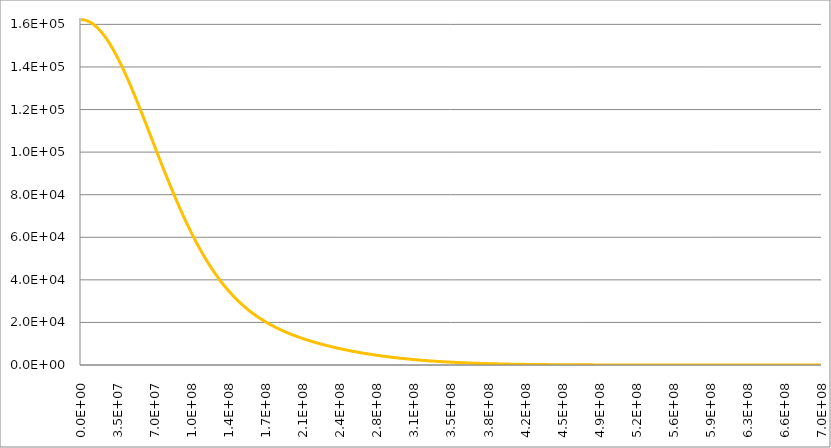
| Category | Series 1 | Series 0 | Series 2 | Series 3 |
|---|---|---|---|---|
| 0.0 |  |  |  | 1622 |
| 347850.0 |  |  |  | 162198.039 |
| 695700.0 |  |  |  | 162192.158 |
| 1043550.0 |  |  |  | 162182.356 |
| 1391400.0 |  |  |  | 162168.634 |
| 1739250.0 |  |  |  | 162150.993 |
| 2087100.0 |  |  |  | 162129.436 |
| 2434950.0 |  |  |  | 162103.963 |
| 2782800.0 |  |  |  | 162074.578 |
| 3130650.0 |  |  |  | 162041.281 |
| 3478500.0 |  |  |  | 162004.077 |
| 3826350.0 |  |  |  | 161962.969 |
| 4174200.0 |  |  |  | 161917.959 |
| 4522050.0 |  |  |  | 161869.052 |
| 4869900.0 |  |  |  | 161816.252 |
| 5217750.0 |  |  |  | 161759.564 |
| 5565600.0 |  |  |  | 161698.991 |
| 5913450.0 |  |  |  | 161634.54 |
| 6261300.0 |  |  |  | 161566.216 |
| 6609150.0 |  |  |  | 161494.024 |
| 6957000.0 |  |  |  | 161417.971 |
| 7304850.0 |  |  |  | 161338.063 |
| 7652700.0 |  |  |  | 161254.306 |
| 8000550.0 |  |  |  | 161166.709 |
| 8348400.0 |  |  |  | 161075.278 |
| 8696250.0 |  |  |  | 160980.021 |
| 9044100.0 |  |  |  | 160880.946 |
| 9391950.0 |  |  |  | 160778.061 |
| 9739800.0 |  |  |  | 160671.376 |
| 10087650.0 |  |  |  | 160560.899 |
| 10435500.0 |  |  |  | 160446.639 |
| 10783350.0 |  |  |  | 160328.606 |
| 11131200.0 |  |  |  | 160206.81 |
| 11479050.0 |  |  |  | 160081.261 |
| 11826900.0 |  |  |  | 159951.97 |
| 12174750.0 |  |  |  | 159818.948 |
| 12522600.0 |  |  |  | 159682.205 |
| 12870450.0 |  |  |  | 159541.753 |
| 13218300.0 |  |  |  | 159397.605 |
| 13566150.0 |  |  |  | 159249.771 |
| 13914000.0 |  |  |  | 159098.265 |
| 14261850.0 |  |  |  | 158943.099 |
| 14609700.0 |  |  |  | 158784.286 |
| 14957550.0 |  |  |  | 158621.839 |
| 15305400.0 |  |  |  | 158455.772 |
| 15653250.0 |  |  |  | 158286.098 |
| 16001100.0 |  |  |  | 158112.832 |
| 16348950.0 |  |  |  | 157935.989 |
| 16696800.0 |  |  |  | 157755.582 |
| 17044650.0 |  |  |  | 157571.626 |
| 17392500.0 |  |  |  | 157384.138 |
| 17740350.0 |  |  |  | 157193.133 |
| 18088200.0 |  |  |  | 156998.625 |
| 18436050.0 |  |  |  | 156800.632 |
| 18783900.0 |  |  |  | 156599.17 |
| 19131750.0 |  |  |  | 156394.255 |
| 19479600.0 |  |  |  | 156185.904 |
| 19827450.0 |  |  |  | 155974.134 |
| 20175300.0 |  |  |  | 155758.963 |
| 20523150.0 |  |  |  | 155540.408 |
| 20871000.0 |  |  |  | 155318.488 |
| 21218850.0 |  |  |  | 155093.219 |
| 21566700.0 |  |  |  | 154864.622 |
| 21914550.0 |  |  |  | 154632.714 |
| 22262400.0 |  |  |  | 154397.514 |
| 22610250.0 |  |  |  | 154159.042 |
| 22958100.0 |  |  |  | 153917.316 |
| 23305950.0 |  |  |  | 153672.357 |
| 23653800.0 |  |  |  | 153424.184 |
| 24001650.0 |  |  |  | 153172.818 |
| 24349500.0 |  |  |  | 152918.278 |
| 24697350.0 |  |  |  | 152660.585 |
| 25045200.0 |  |  |  | 152399.76 |
| 25393050.0 |  |  |  | 152135.824 |
| 25740900.0 |  |  |  | 151868.798 |
| 26088750.0 |  |  |  | 151598.703 |
| 26436600.0 |  |  |  | 151325.562 |
| 26784450.0 |  |  |  | 151049.395 |
| 27132300.0 |  |  |  | 150770.225 |
| 27480150.0 |  |  |  | 150488.075 |
| 27828000.0 |  |  |  | 150202.966 |
| 28175850.0 |  |  |  | 149914.921 |
| 28523700.0 |  |  |  | 149623.963 |
| 28871550.0 |  |  |  | 149330.115 |
| 29219400.0 |  |  |  | 149033.4 |
| 29567250.0 |  |  |  | 148733.842 |
| 29915100.0 |  |  |  | 148431.464 |
| 30262950.0 |  |  |  | 148126.289 |
| 30610800.0 |  |  |  | 147818.343 |
| 30958650.0 |  |  |  | 147507.648 |
| 31306500.0 |  |  |  | 147194.229 |
| 31654350.0 |  |  |  | 146878.11 |
| 32002200.0 |  |  |  | 146559.316 |
| 32350050.0 |  |  |  | 146237.872 |
| 32697900.0 |  |  |  | 145913.803 |
| 33045750.0 |  |  |  | 145587.133 |
| 33393600.0 |  |  |  | 145257.887 |
| 33741450.0 |  |  |  | 144926.092 |
| 34089300.0 |  |  |  | 144591.772 |
| 34437150.0 |  |  |  | 144254.953 |
| 34785000.0 |  |  |  | 143915.661 |
| 35132850.0 |  |  |  | 143573.921 |
| 35480700.0 |  |  |  | 143229.76 |
| 35828550.0 |  |  |  | 142883.203 |
| 36176400.0 |  |  |  | 142534.277 |
| 36524250.0 |  |  |  | 142183.009 |
| 36872100.0 |  |  |  | 141829.424 |
| 37219950.0 |  |  |  | 141473.549 |
| 37567800.0 |  |  |  | 141115.411 |
| 37915650.0 |  |  |  | 140755.037 |
| 38263500.0 |  |  |  | 140392.453 |
| 38611350.0 |  |  |  | 140027.686 |
| 38959200.0 |  |  |  | 139660.764 |
| 39307050.0 |  |  |  | 139291.713 |
| 39654900.0 |  |  |  | 138920.561 |
| 40002750.0 |  |  |  | 138547.335 |
| 40350600.0 |  |  |  | 138172.063 |
| 40698450.0 |  |  |  | 137794.771 |
| 41046300.0 |  |  |  | 137415.488 |
| 41394150.0 |  |  |  | 137034.24 |
| 41742000.0 |  |  |  | 136651.057 |
| 42089850.0 |  |  |  | 136265.964 |
| 42437700.0 |  |  |  | 135878.991 |
| 42785550.0 |  |  |  | 135490.165 |
| 43133400.0 |  |  |  | 135099.513 |
| 43481250.0 |  |  |  | 134707.065 |
| 43829100.0 |  |  |  | 134312.847 |
| 44176950.0 |  |  |  | 133916.887 |
| 44524800.0 |  |  |  | 133519.215 |
| 44872650.0 |  |  |  | 133119.857 |
| 45220500.0 |  |  |  | 132718.842 |
| 45568350.0 |  |  |  | 132316.198 |
| 45916200.0 |  |  |  | 131911.953 |
| 46264050.0 |  |  |  | 131506.135 |
| 46611900.0 |  |  |  | 131098.773 |
| 46959750.0 |  |  |  | 130689.895 |
| 47307600.0 |  |  |  | 130279.529 |
| 47655450.0 |  |  |  | 129867.702 |
| 48003300.0 |  |  |  | 129454.445 |
| 48351150.0 |  |  |  | 129039.783 |
| 48699000.0 |  |  |  | 128623.747 |
| 49046850.0 |  |  |  | 128206.363 |
| 49394700.0 |  |  |  | 127787.661 |
| 49742550.0 |  |  |  | 127367.668 |
| 50090400.0 |  |  |  | 126946.412 |
| 50438250.0 |  |  |  | 126523.922 |
| 50786100.0 |  |  |  | 126100.226 |
| 51133950.0 |  |  |  | 125675.352 |
| 51481800.0 |  |  |  | 125249.328 |
| 51829650.0 |  |  |  | 124822.181 |
| 52177500.0 |  |  |  | 124393.941 |
| 52525350.0 |  |  |  | 123964.634 |
| 52873200.0 |  |  |  | 123534.29 |
| 53221050.0 |  |  |  | 123102.935 |
| 53568900.0 |  |  |  | 122670.597 |
| 53916750.0 |  |  |  | 122237.305 |
| 54264600.0 |  |  |  | 121803.086 |
| 54612450.0 |  |  |  | 121367.967 |
| 54960300.0 |  |  |  | 120931.977 |
| 55308150.0 |  |  |  | 120495.142 |
| 55656000.0 |  |  |  | 120057.491 |
| 56003850.0 |  |  |  | 119619.05 |
| 56351700.0 |  |  |  | 119179.847 |
| 56699550.0 |  |  |  | 118739.91 |
| 57047400.0 |  |  |  | 118299.264 |
| 57395250.0 |  |  |  | 117857.939 |
| 57743100.0 |  |  |  | 117415.96 |
| 58090950.0 |  |  |  | 116973.354 |
| 58438800.0 |  |  |  | 116530.148 |
| 58786650.0 |  |  |  | 116086.37 |
| 59134500.0 |  |  |  | 115642.045 |
| 59482350.0 |  |  |  | 115197.2 |
| 59830200.0 |  |  |  | 114751.862 |
| 60178050.0 |  |  |  | 114306.057 |
| 60525900.0 |  |  |  | 113859.811 |
| 60873750.0 |  |  |  | 113413.15 |
| 61221600.0 |  |  |  | 112966.101 |
| 61569450.0 |  |  |  | 112518.69 |
| 61917300.0 |  |  |  | 112070.941 |
| 62265150.0 |  |  |  | 111622.882 |
| 62613000.0 |  |  |  | 111174.536 |
| 62960850.0 |  |  |  | 110725.931 |
| 63308700.0 |  |  |  | 110277.091 |
| 63656550.0 |  |  |  | 109828.041 |
| 64004400.0 |  |  |  | 109378.807 |
| 64352250.0 |  |  |  | 108929.413 |
| 64700100.0 |  |  |  | 108479.885 |
| 65047950.0 |  |  |  | 108030.246 |
| 65395800.0 |  |  |  | 107580.522 |
| 65743650.0 |  |  |  | 107130.737 |
| 66091500.0 |  |  |  | 106680.915 |
| 66439350.0 |  |  |  | 106231.08 |
| 66787200.0 |  |  |  | 105781.257 |
| 67135050.0 |  |  |  | 105331.468 |
| 67482900.0 |  |  |  | 104881.738 |
| 67830750.0 |  |  |  | 104432.091 |
| 68178600.0 |  |  |  | 103982.549 |
| 68526450.0 |  |  |  | 103533.136 |
| 68874300.0 |  |  |  | 103083.875 |
| 69222150.0 |  |  |  | 102634.789 |
| 69570000.0 |  |  |  | 102185.9 |
| 69917850.0 |  |  |  | 101737.232 |
| 70265700.0 |  |  |  | 101288.807 |
| 70613550.0 |  |  |  | 100840.646 |
| 70961400.0 |  |  |  | 100392.772 |
| 71309250.0 |  |  |  | 99945.207 |
| 71657100.0 |  |  |  | 99497.973 |
| 72004950.0 |  |  |  | 99051.091 |
| 72352800.0 |  |  |  | 98604.583 |
| 72700650.0 |  |  |  | 98158.47 |
| 73048500.0 |  |  |  | 97712.772 |
| 73396350.0 |  |  |  | 97267.512 |
| 73744200.0 |  |  |  | 96822.709 |
| 74092050.0 |  |  |  | 96378.385 |
| 74439900.0 |  |  |  | 95934.559 |
| 74787750.0 |  |  |  | 95491.252 |
| 75135600.0 |  |  |  | 95048.483 |
| 75483450.0 |  |  |  | 94606.273 |
| 75831300.0 |  |  |  | 94164.641 |
| 76179150.0 |  |  |  | 93723.607 |
| 76527000.0 |  |  |  | 93283.19 |
| 76874850.0 |  |  |  | 92843.408 |
| 77222700.0 |  |  |  | 92404.281 |
| 77570550.0 |  |  |  | 91965.828 |
| 77918400.0 |  |  |  | 91528.067 |
| 78266250.0 |  |  |  | 91091.016 |
| 78614100.0 |  |  |  | 90654.694 |
| 78961950.0 |  |  |  | 90219.118 |
| 79309800.0 |  |  |  | 89784.306 |
| 79657650.0 |  |  |  | 89350.276 |
| 80005500.0 |  |  |  | 88917.045 |
| 80353350.0 |  |  |  | 88484.63 |
| 80701200.0 |  |  |  | 88053.048 |
| 81049050.0 |  |  |  | 87622.316 |
| 81396900.0 |  |  |  | 87192.451 |
| 81744750.0 |  |  |  | 86763.468 |
| 82092600.0 |  |  |  | 86335.384 |
| 82440450.0 |  |  |  | 85908.215 |
| 82788300.0 |  |  |  | 85481.977 |
| 83136150.0 |  |  |  | 85056.685 |
| 83484000.0 |  |  |  | 84632.355 |
| 83831850.0 |  |  |  | 84209.001 |
| 84179700.0 |  |  |  | 83786.64 |
| 84527550.0 |  |  |  | 83365.285 |
| 84875400.0 |  |  |  | 82944.951 |
| 85223250.0 |  |  |  | 82525.652 |
| 85571100.0 |  |  |  | 82107.404 |
| 85918950.0 |  |  |  | 81690.219 |
| 86266800.0 |  |  |  | 81274.111 |
| 86614650.0 |  |  |  | 80859.094 |
| 86962500.0 |  |  |  | 80445.182 |
| 87310350.0 |  |  |  | 80032.387 |
| 87658200.0 |  |  |  | 79620.722 |
| 88006050.0 |  |  |  | 79210.201 |
| 88353900.0 |  |  |  | 78800.835 |
| 88701750.0 |  |  |  | 78392.638 |
| 89049600.0 |  |  |  | 77985.621 |
| 89397450.0 |  |  |  | 77579.796 |
| 89745300.0 |  |  |  | 77175.175 |
| 90093150.0 |  |  |  | 76771.769 |
| 90441000.0 |  |  |  | 76369.591 |
| 90788850.0 |  |  |  | 75968.65 |
| 91136700.0 |  |  |  | 75568.959 |
| 91484550.0 |  |  |  | 75170.527 |
| 91832400.0 |  |  |  | 74773.366 |
| 92180250.0 |  |  |  | 74377.485 |
| 92528100.0 |  |  |  | 73982.895 |
| 92875950.0 |  |  |  | 73589.606 |
| 93223800.0 |  |  |  | 73197.627 |
| 93571650.0 |  |  |  | 72806.969 |
| 93919500.0 |  |  |  | 72417.64 |
| 94267350.0 |  |  |  | 72029.649 |
| 94615200.0 |  |  |  | 71643.006 |
| 94963050.0 |  |  |  | 71257.72 |
| 95310900.0 |  |  |  | 70873.799 |
| 95658750.0 |  |  |  | 70491.251 |
| 96006600.0 |  |  |  | 70110.085 |
| 96354450.0 |  |  |  | 69730.308 |
| 96702300.0 |  |  |  | 69351.929 |
| 97050150.0 |  |  |  | 68974.955 |
| 97398000.0 |  |  |  | 68599.394 |
| 97745850.0 |  |  |  | 68225.253 |
| 98093700.0 |  |  |  | 67852.538 |
| 98441550.0 |  |  |  | 67481.257 |
| 98789400.0 |  |  |  | 67111.417 |
| 99137250.0 |  |  |  | 66743.023 |
| 99485100.0 |  |  |  | 66376.083 |
| 99832950.0 |  |  |  | 66010.602 |
| 100180800.0 |  |  |  | 65646.587 |
| 100528650.0 |  |  |  | 65284.043 |
| 100876500.0 |  |  |  | 64922.976 |
| 101224350.0 |  |  |  | 64563.39 |
| 101572200.0 |  |  |  | 64205.293 |
| 101920050.0 |  |  |  | 63848.688 |
| 102267900.0 |  |  |  | 63493.58 |
| 102615750.0 |  |  |  | 63139.974 |
| 102963600.0 |  |  |  | 62787.875 |
| 103311450.0 |  |  |  | 62437.287 |
| 103659300.0 |  |  |  | 62088.214 |
| 104007150.0 |  |  |  | 61740.66 |
| 104355000.0 |  |  |  | 61394.629 |
| 104702850.0 |  |  |  | 61050.125 |
| 105050700.0 |  |  |  | 60707.151 |
| 105398550.0 |  |  |  | 60365.711 |
| 105746400.0 |  |  |  | 60025.807 |
| 106094250.0 |  |  |  | 59687.443 |
| 106442100.0 |  |  |  | 59350.622 |
| 106789950.0 |  |  |  | 59015.346 |
| 107137800.0 |  |  |  | 58681.618 |
| 107485650.0 |  |  |  | 58349.44 |
| 107833500.0 |  |  |  | 58018.815 |
| 108181350.0 |  |  |  | 57689.743 |
| 108529200.0 |  |  |  | 57362.229 |
| 108877050.0 |  |  |  | 57036.272 |
| 109224900.0 |  |  |  | 56711.875 |
| 109572750.0 |  |  |  | 56389.039 |
| 109920600.0 |  |  |  | 56067.765 |
| 110268450.0 |  |  |  | 55748.055 |
| 110616300.0 |  |  |  | 55429.909 |
| 110964150.0 |  |  |  | 55113.329 |
| 111312000.0 |  |  |  | 54798.315 |
| 111659850.0 |  |  |  | 54484.867 |
| 112007700.0 |  |  |  | 54172.987 |
| 112355550.0 |  |  |  | 53862.674 |
| 112703400.0 |  |  |  | 53553.928 |
| 113051250.0 |  |  |  | 53246.75 |
| 113399100.0 |  |  |  | 52941.138 |
| 113746950.0 |  |  |  | 52637.094 |
| 114094800.0 |  |  |  | 52334.617 |
| 114442650.0 |  |  |  | 52033.706 |
| 114790500.0 |  |  |  | 51734.36 |
| 115138350.0 |  |  |  | 51436.578 |
| 115486200.0 |  |  |  | 51140.36 |
| 115834050.0 |  |  |  | 50845.705 |
| 116181900.0 |  |  |  | 50552.611 |
| 116529750.0 |  |  |  | 50261.078 |
| 116877600.0 |  |  |  | 49971.103 |
| 117225450.0 |  |  |  | 49682.685 |
| 117573300.0 |  |  |  | 49395.823 |
| 117921150.0 |  |  |  | 49110.514 |
| 118269000.0 |  |  |  | 48826.757 |
| 118616850.0 |  |  |  | 48544.55 |
| 118964700.0 |  |  |  | 48263.89 |
| 119312550.0 |  |  |  | 47984.776 |
| 119660400.0 |  |  |  | 47707.205 |
| 120008250.0 |  |  |  | 47431.175 |
| 120356100.0 |  |  |  | 47156.682 |
| 120703950.0 |  |  |  | 46883.725 |
| 121051800.0 |  |  |  | 46612.301 |
| 121399650.0 |  |  |  | 46342.406 |
| 121747500.0 |  |  |  | 46074.038 |
| 122095350.0 |  |  |  | 45807.193 |
| 122443200.0 |  |  |  | 45541.869 |
| 122791050.0 |  |  |  | 45278.063 |
| 123138900.0 |  |  |  | 45015.769 |
| 123486750.0 |  |  |  | 44754.987 |
| 123834600.0 |  |  |  | 44495.711 |
| 124182450.0 |  |  |  | 44237.938 |
| 124530300.0 |  |  |  | 43981.664 |
| 124878150.0 |  |  |  | 43726.887 |
| 125226000.0 |  |  |  | 43473.6 |
| 125573850.0 |  |  |  | 43221.802 |
| 125921700.0 |  |  |  | 42971.487 |
| 126269550.0 |  |  |  | 42722.651 |
| 126617400.0 |  |  |  | 42475.29 |
| 126965250.0 |  |  |  | 42229.401 |
| 127313100.0 |  |  |  | 41984.977 |
| 127660950.0 |  |  |  | 41742.016 |
| 128008800.0 |  |  |  | 41500.512 |
| 128356650.0 |  |  |  | 41260.461 |
| 128704500.0 |  |  |  | 41021.857 |
| 129052350.0 |  |  |  | 40784.698 |
| 129400200.0 |  |  |  | 40548.976 |
| 129748050.0 |  |  |  | 40314.688 |
| 130095900.0 |  |  |  | 40081.829 |
| 130443750.0 |  |  |  | 39850.393 |
| 130791600.0 |  |  |  | 39620.375 |
| 131139450.0 |  |  |  | 39391.771 |
| 131487300.0 |  |  |  | 39164.575 |
| 131835150.0 |  |  |  | 38938.781 |
| 132183000.0 |  |  |  | 38714.385 |
| 132530850.0 |  |  |  | 38491.381 |
| 132878700.0 |  |  |  | 38269.763 |
| 133226550.0 |  |  |  | 38049.527 |
| 133574400.0 |  |  |  | 37830.665 |
| 133922250.0 |  |  |  | 37613.174 |
| 134270100.0 |  |  |  | 37397.047 |
| 134617950.0 |  |  |  | 37182.278 |
| 134965800.0 |  |  |  | 36968.862 |
| 135313650.0 |  |  |  | 36756.792 |
| 135661500.0 |  |  |  | 36546.064 |
| 136009350.0 |  |  |  | 36336.671 |
| 136357200.0 |  |  |  | 36128.607 |
| 136705050.0 |  |  |  | 35921.866 |
| 137052900.0 |  |  |  | 35716.442 |
| 137400750.0 |  |  |  | 35512.329 |
| 137748600.0 |  |  |  | 35309.522 |
| 138096450.0 |  |  |  | 35108.013 |
| 138444300.0 |  |  |  | 34907.797 |
| 138792150.0 |  |  |  | 34708.867 |
| 139140000.0 |  |  |  | 34511.218 |
| 139487850.0 |  |  |  | 34314.842 |
| 139835700.0 |  |  |  | 34119.735 |
| 140183550.0 |  |  |  | 33925.888 |
| 140531400.0 |  |  |  | 33733.297 |
| 140879250.0 |  |  |  | 33541.954 |
| 141227100.0 |  |  |  | 33351.854 |
| 141574950.0 |  |  |  | 33162.989 |
| 141922800.0 |  |  |  | 32975.353 |
| 142270650.0 |  |  |  | 32788.94 |
| 142618500.0 |  |  |  | 32603.744 |
| 142966350.0 |  |  |  | 32419.757 |
| 143314200.0 |  |  |  | 32236.974 |
| 143662050.0 |  |  |  | 32055.388 |
| 144009900.0 |  |  |  | 31874.991 |
| 144357750.0 |  |  |  | 31695.778 |
| 144705600.0 |  |  |  | 31517.742 |
| 145053450.0 |  |  |  | 31340.876 |
| 145401300.0 |  |  |  | 31165.174 |
| 145749150.0 |  |  |  | 30990.629 |
| 146097000.0 |  |  |  | 30817.234 |
| 146444850.0 |  |  |  | 30644.983 |
| 146792700.0 |  |  |  | 30473.87 |
| 147140550.0 |  |  |  | 30303.886 |
| 147488400.0 |  |  |  | 30135.026 |
| 147836250.0 |  |  |  | 29967.283 |
| 148184100.0 |  |  |  | 29800.65 |
| 148531950.0 |  |  |  | 29635.121 |
| 148879800.0 |  |  |  | 29470.689 |
| 149227650.0 |  |  |  | 29307.346 |
| 149575500.0 |  |  |  | 29145.088 |
| 149923350.0 |  |  |  | 28983.905 |
| 150271200.0 |  |  |  | 28823.793 |
| 150619050.0 |  |  |  | 28664.744 |
| 150966900.0 |  |  |  | 28506.752 |
| 151314750.0 |  |  |  | 28349.81 |
| 151662600.0 |  |  |  | 28193.91 |
| 152010450.0 |  |  |  | 28039.047 |
| 152358300.0 |  |  |  | 27885.214 |
| 152706150.0 |  |  |  | 27732.404 |
| 153054000.0 |  |  |  | 27580.61 |
| 153401850.0 |  |  |  | 27429.826 |
| 153749700.0 |  |  |  | 27280.044 |
| 154097550.0 |  |  |  | 27131.26 |
| 154445400.0 |  |  |  | 26983.464 |
| 154793250.0 |  |  |  | 26836.652 |
| 155141100.0 |  |  |  | 26690.817 |
| 155488950.0 |  |  |  | 26545.951 |
| 155836800.0 |  |  |  | 26402.048 |
| 156184650.0 |  |  |  | 26259.102 |
| 156532500.0 |  |  |  | 26117.105 |
| 156880350.0 |  |  |  | 25976.052 |
| 157228200.0 |  |  |  | 25835.937 |
| 157576050.0 |  |  |  | 25696.751 |
| 157923900.0 |  |  |  | 25558.489 |
| 158271750.0 |  |  |  | 25421.144 |
| 158619600.0 |  |  |  | 25284.711 |
| 158967450.0 |  |  |  | 25149.181 |
| 159315300.0 |  |  |  | 25014.55 |
| 159663150.0 |  |  |  | 24880.81 |
| 160011000.0 |  |  |  | 24747.955 |
| 160358850.0 |  |  |  | 24615.978 |
| 160706700.0 |  |  |  | 24484.874 |
| 161054550.0 |  |  |  | 24354.636 |
| 161402400.0 |  |  |  | 24225.257 |
| 161750250.0 |  |  |  | 24096.731 |
| 162098100.0 |  |  |  | 23969.053 |
| 162445950.0 |  |  |  | 23842.215 |
| 162793800.0 |  |  |  | 23716.211 |
| 163141650.0 |  |  |  | 23591.036 |
| 163489500.0 |  |  |  | 23466.683 |
| 163837350.0 |  |  |  | 23343.145 |
| 164185200.0 |  |  |  | 23220.417 |
| 164533050.0 |  |  |  | 23098.493 |
| 164880900.0 |  |  |  | 22977.366 |
| 165228750.0 |  |  |  | 22857.031 |
| 165576600.0 |  |  |  | 22737.481 |
| 165924450.0 |  |  |  | 22618.71 |
| 166272300.0 |  |  |  | 22500.713 |
| 166620150.0 |  |  |  | 22383.483 |
| 166968000.0 |  |  |  | 22267.015 |
| 167315850.0 |  |  |  | 22151.302 |
| 167663700.0 |  |  |  | 22036.338 |
| 168011550.0 |  |  |  | 21922.119 |
| 168359400.0 |  |  |  | 21808.637 |
| 168707250.0 |  |  |  | 21695.888 |
| 169055100.0 |  |  |  | 21583.865 |
| 169402950.0 |  |  |  | 21472.563 |
| 169750800.0 |  |  |  | 21361.975 |
| 170098650.0 |  |  |  | 21252.098 |
| 170446500.0 |  |  |  | 21142.923 |
| 170794350.0 |  |  |  | 21034.447 |
| 171142200.0 |  |  |  | 20926.663 |
| 171490050.0 |  |  |  | 20819.567 |
| 171837900.0 |  |  |  | 20713.151 |
| 172185750.0 |  |  |  | 20607.412 |
| 172533600.0 |  |  |  | 20502.343 |
| 172881450.0 |  |  |  | 20397.939 |
| 173229300.0 |  |  |  | 20294.195 |
| 173577150.0 |  |  |  | 20191.105 |
| 173925000.0 |  |  |  | 20088.664 |
| 174272850.0 |  |  |  | 19986.866 |
| 174620700.0 |  |  |  | 19885.708 |
| 174968550.0 |  |  |  | 19785.182 |
| 175316400.0 |  |  |  | 19685.285 |
| 175664250.0 |  |  |  | 19586.01 |
| 176012100.0 |  |  |  | 19487.353 |
| 176359950.0 |  |  |  | 19389.309 |
| 176707800.0 |  |  |  | 19291.872 |
| 177055650.0 |  |  |  | 19195.038 |
| 177403500.0 |  |  |  | 19098.801 |
| 177751350.0 |  |  |  | 19003.158 |
| 178099200.0 |  |  |  | 18908.101 |
| 178447050.0 |  |  |  | 18813.628 |
| 178794900.0 |  |  |  | 18719.733 |
| 179142750.0 |  |  |  | 18626.41 |
| 179490600.0 |  |  |  | 18533.657 |
| 179838450.0 |  |  |  | 18441.466 |
| 180186300.0 |  |  |  | 18349.835 |
| 180534150.0 |  |  |  | 18258.758 |
| 180882000.0 |  |  |  | 18168.23 |
| 181229850.0 |  |  |  | 18078.248 |
| 181577700.0 |  |  |  | 17988.805 |
| 181925550.0 |  |  |  | 17899.899 |
| 182273400.0 |  |  |  | 17811.524 |
| 182621250.0 |  |  |  | 17723.676 |
| 182969100.0 |  |  |  | 17636.35 |
| 183316950.0 |  |  |  | 17549.542 |
| 183664800.0 |  |  |  | 17463.248 |
| 184012650.0 |  |  |  | 17377.464 |
| 184360500.0 |  |  |  | 17292.184 |
| 184708350.0 |  |  |  | 17207.405 |
| 185056200.0 |  |  |  | 17123.122 |
| 185404050.0 |  |  |  | 17039.332 |
| 185751900.0 |  |  |  | 16956.03 |
| 186099750.0 |  |  |  | 16873.212 |
| 186447600.0 |  |  |  | 16790.874 |
| 186795450.0 |  |  |  | 16709.011 |
| 187143300.0 |  |  |  | 16627.621 |
| 187491150.0 |  |  |  | 16546.698 |
| 187839000.0 |  |  |  | 16466.24 |
| 188186850.0 |  |  |  | 16386.241 |
| 188534700.0 |  |  |  | 16306.698 |
| 188882550.0 |  |  |  | 16227.608 |
| 189230400.0 |  |  |  | 16148.965 |
| 189578250.0 |  |  |  | 16070.768 |
| 189926100.0 |  |  |  | 15993.011 |
| 190273950.0 |  |  |  | 15915.691 |
| 190621800.0 |  |  |  | 15838.805 |
| 190969650.0 |  |  |  | 15762.349 |
| 191317500.0 |  |  |  | 15686.318 |
| 191665350.0 |  |  |  | 15610.71 |
| 192013200.0 |  |  |  | 15535.521 |
| 192361050.0 |  |  |  | 15460.748 |
| 192708900.0 |  |  |  | 15386.386 |
| 193056750.0 |  |  |  | 15312.433 |
| 193404600.0 |  |  |  | 15238.885 |
| 193752450.0 |  |  |  | 15165.739 |
| 194100300.0 |  |  |  | 15092.991 |
| 194448150.0 |  |  |  | 15020.638 |
| 194796000.0 |  |  |  | 14948.676 |
| 195143850.0 |  |  |  | 14877.103 |
| 195491700.0 |  |  |  | 14805.915 |
| 195839550.0 |  |  |  | 14735.109 |
| 196187400.0 |  |  |  | 14664.681 |
| 196535250.0 |  |  |  | 14594.629 |
| 196883100.0 |  |  |  | 14524.95 |
| 197230950.0 |  |  |  | 14455.64 |
| 197578800.0 |  |  |  | 14386.696 |
| 197926650.0 |  |  |  | 14318.116 |
| 198274500.0 |  |  |  | 14249.896 |
| 198622350.0 |  |  |  | 14182.033 |
| 198970200.0 |  |  |  | 14114.525 |
| 199318050.0 |  |  |  | 14047.368 |
| 199665900.0 |  |  |  | 13980.56 |
| 200013750.0 |  |  |  | 13914.097 |
| 200361600.0 |  |  |  | 13847.978 |
| 200709450.0 |  |  |  | 13782.198 |
| 201057300.0 |  |  |  | 13716.756 |
| 201405150.0 |  |  |  | 13651.649 |
| 201753000.0 |  |  |  | 13586.873 |
| 202100850.0 |  |  |  | 13522.427 |
| 202448700.0 |  |  |  | 13458.308 |
| 202796550.0 |  |  |  | 13394.512 |
| 203144400.0 |  |  |  | 13331.038 |
| 203492250.0 |  |  |  | 13267.883 |
| 203840100.0 |  |  |  | 13205.043 |
| 204187950.0 |  |  |  | 13142.518 |
| 204535800.0 |  |  |  | 13080.304 |
| 204883650.0 |  |  |  | 13018.399 |
| 205231500.0 |  |  |  | 12956.8 |
| 205579350.0 |  |  |  | 12895.505 |
| 205927200.0 |  |  |  | 12834.512 |
| 206275050.0 |  |  |  | 12773.818 |
| 206622900.0 |  |  |  | 12713.421 |
| 206970750.0 |  |  |  | 12653.319 |
| 207318600.0 |  |  |  | 12593.509 |
| 207666450.0 |  |  |  | 12533.989 |
| 208014300.0 |  |  |  | 12474.757 |
| 208362150.0 |  |  |  | 12415.81 |
| 208710000.0 |  |  |  | 12357.147 |
| 209057850.0 |  |  |  | 12298.765 |
| 209405700.0 |  |  |  | 12240.662 |
| 209753550.0 |  |  |  | 12182.837 |
| 210101400.0 |  |  |  | 12125.286 |
| 210449250.0 |  |  |  | 12068.009 |
| 210797100.0 |  |  |  | 12011.002 |
| 211144950.0 |  |  |  | 11954.264 |
| 211492800.0 |  |  |  | 11897.793 |
| 211840650.0 |  |  |  | 11841.587 |
| 212188500.0 |  |  |  | 11785.643 |
| 212536350.0 |  |  |  | 11729.961 |
| 212884200.0 |  |  |  | 11674.538 |
| 213232050.0 |  |  |  | 11619.372 |
| 213579900.0 |  |  |  | 11564.461 |
| 213927750.0 |  |  |  | 11509.804 |
| 214275600.0 |  |  |  | 11455.399 |
| 214623450.0 |  |  |  | 11401.243 |
| 214971300.0 |  |  |  | 11347.336 |
| 215319150.0 |  |  |  | 11293.675 |
| 215667000.0 |  |  |  | 11240.259 |
| 216014850.0 |  |  |  | 11187.085 |
| 216362700.0 |  |  |  | 11134.153 |
| 216710550.0 |  |  |  | 11081.46 |
| 217058400.0 |  |  |  | 11029.006 |
| 217406250.0 |  |  |  | 10976.787 |
| 217754100.0 |  |  |  | 10924.803 |
| 218101950.0 |  |  |  | 10873.052 |
| 218449800.0 |  |  |  | 10821.533 |
| 218797650.0 |  |  |  | 10770.243 |
| 219145500.0 |  |  |  | 10719.182 |
| 219493350.0 |  |  |  | 10668.348 |
| 219841200.0 |  |  |  | 10617.739 |
| 220189050.0 |  |  |  | 10567.353 |
| 220536900.0 |  |  |  | 10517.19 |
| 220884750.0 |  |  |  | 10467.248 |
| 221232600.0 |  |  |  | 10417.526 |
| 221580450.0 |  |  |  | 10368.021 |
| 221928300.0 |  |  |  | 10318.733 |
| 222276150.0 |  |  |  | 10269.661 |
| 222624000.0 |  |  |  | 10220.802 |
| 222971850.0 |  |  |  | 10172.156 |
| 223319700.0 |  |  |  | 10123.72 |
| 223667550.0 |  |  |  | 10075.495 |
| 224015400.0 |  |  |  | 10027.478 |
| 224363250.0 |  |  |  | 9979.669 |
| 224711100.0 |  |  |  | 9932.065 |
| 225058950.0 |  |  |  | 9884.667 |
| 225406800.0 |  |  |  | 9837.471 |
| 225754650.0 |  |  |  | 9790.478 |
| 226102500.0 |  |  |  | 9743.686 |
| 226450350.0 |  |  |  | 9697.094 |
| 226798200.0 |  |  |  | 9650.701 |
| 227146050.0 |  |  |  | 9604.505 |
| 227493900.0 |  |  |  | 9558.505 |
| 227841750.0 |  |  |  | 9512.7 |
| 228189600.0 |  |  |  | 9467.09 |
| 228537450.0 |  |  |  | 9421.672 |
| 228885300.0 |  |  |  | 9376.446 |
| 229233150.0 |  |  |  | 9331.411 |
| 229581000.0 |  |  |  | 9286.566 |
| 229928850.0 |  |  |  | 9241.909 |
| 230276700.0 |  |  |  | 9197.439 |
| 230624550.0 |  |  |  | 9153.156 |
| 230972400.0 |  |  |  | 9109.059 |
| 231320250.0 |  |  |  | 9065.146 |
| 231668100.0 |  |  |  | 9021.416 |
| 232015950.0 |  |  |  | 8977.869 |
| 232363800.0 |  |  |  | 8934.504 |
| 232711650.0 |  |  |  | 8891.318 |
| 233059500.0 |  |  |  | 8848.313 |
| 233407350.0 |  |  |  | 8805.486 |
| 233755200.0 |  |  |  | 8762.836 |
| 234103050.0 |  |  |  | 8720.363 |
| 234450900.0 |  |  |  | 8678.067 |
| 234798750.0 |  |  |  | 8635.945 |
| 235146600.0 |  |  |  | 8593.997 |
| 235494450.0 |  |  |  | 8552.222 |
| 235842300.0 |  |  |  | 8510.619 |
| 236190150.0 |  |  |  | 8469.188 |
| 236538000.0 |  |  |  | 8427.927 |
| 236885850.0 |  |  |  | 8386.836 |
| 237233700.0 |  |  |  | 8345.914 |
| 237581550.0 |  |  |  | 8305.16 |
| 237929400.0 |  |  |  | 8264.574 |
| 238277250.0 |  |  |  | 8224.153 |
| 238625100.0 |  |  |  | 8183.899 |
| 238972950.0 |  |  |  | 8143.809 |
| 239320800.0 |  |  |  | 8103.883 |
| 239668650.0 |  |  |  | 8064.121 |
| 240016500.0 |  |  |  | 8024.521 |
| 240364350.0 |  |  |  | 7985.083 |
| 240712200.0 |  |  |  | 7945.806 |
| 241060050.0 |  |  |  | 7906.689 |
| 241407900.0 |  |  |  | 7867.732 |
| 241755750.0 |  |  |  | 7828.933 |
| 242103600.0 |  |  |  | 7790.293 |
| 242451450.0 |  |  |  | 7751.811 |
| 242799300.0 |  |  |  | 7713.485 |
| 243147150.0 |  |  |  | 7675.315 |
| 243495000.0 |  |  |  | 7637.3 |
| 243842850.0 |  |  |  | 7599.441 |
| 244190700.0 |  |  |  | 7561.735 |
| 244538550.0 |  |  |  | 7524.183 |
| 244886400.0 |  |  |  | 7486.783 |
| 245234250.0 |  |  |  | 7449.536 |
| 245582100.0 |  |  |  | 7412.44 |
| 245929950.0 |  |  |  | 7375.495 |
| 246277800.0 |  |  |  | 7338.7 |
| 246625650.0 |  |  |  | 7302.055 |
| 246973500.0 |  |  |  | 7265.558 |
| 247321350.0 |  |  |  | 7229.21 |
| 247669200.0 |  |  |  | 7193.01 |
| 248017050.0 |  |  |  | 7156.957 |
| 248364900.0 |  |  |  | 7121.05 |
| 248712750.0 |  |  |  | 7085.29 |
| 249060600.0 |  |  |  | 7049.675 |
| 249408450.0 |  |  |  | 7014.204 |
| 249756300.0 |  |  |  | 6978.878 |
| 250104150.0 |  |  |  | 6943.696 |
| 250452000.0 |  |  |  | 6908.657 |
| 250799850.0 |  |  |  | 6873.761 |
| 251147700.0 |  |  |  | 6839.006 |
| 251495550.0 |  |  |  | 6804.393 |
| 251843400.0 |  |  |  | 6769.922 |
| 252191250.0 |  |  |  | 6735.59 |
| 252539100.0 |  |  |  | 6701.399 |
| 252886950.0 |  |  |  | 6667.347 |
| 253234800.0 |  |  |  | 6633.434 |
| 253582650.0 |  |  |  | 6599.659 |
| 253930500.0 |  |  |  | 6566.022 |
| 254278350.0 |  |  |  | 6532.523 |
| 254626200.0 |  |  |  | 6499.16 |
| 254974050.0 |  |  |  | 6465.934 |
| 255321900.0 |  |  |  | 6432.844 |
| 255669750.0 |  |  |  | 6399.889 |
| 256017600.0 |  |  |  | 6367.069 |
| 256365450.0 |  |  |  | 6334.383 |
| 256713300.0 |  |  |  | 6301.832 |
| 257061150.0 |  |  |  | 6269.414 |
| 257409000.0 |  |  |  | 6237.129 |
| 257756850.0 |  |  |  | 6204.977 |
| 258104700.0 |  |  |  | 6172.957 |
| 258452550.0 |  |  |  | 6141.068 |
| 258800400.0 |  |  |  | 6109.311 |
| 259148250.0 |  |  |  | 6077.685 |
| 259496100.0 |  |  |  | 6046.189 |
| 259843950.0 |  |  |  | 6014.822 |
| 260191800.0 |  |  |  | 5983.586 |
| 260539650.0 |  |  |  | 5952.478 |
| 260887500.0 |  |  |  | 5921.499 |
| 261235350.0 |  |  |  | 5890.648 |
| 261583200.0 |  |  |  | 5859.925 |
| 261931050.0 |  |  |  | 5829.329 |
| 262278900.0 |  |  |  | 5798.86 |
| 262626750.0 |  |  |  | 5768.517 |
| 262974600.0 |  |  |  | 5738.301 |
| 263322450.0 |  |  |  | 5708.21 |
| 263670300.0 |  |  |  | 5678.244 |
| 264018150.0 |  |  |  | 5648.403 |
| 264366000.0 |  |  |  | 5618.687 |
| 264713850.0 |  |  |  | 5589.095 |
| 265061700.0 |  |  |  | 5559.626 |
| 265409550.0 |  |  |  | 5530.281 |
| 265757400.0 |  |  |  | 5501.058 |
| 266105250.0 |  |  |  | 5471.958 |
| 266453100.0 |  |  |  | 5442.98 |
| 266800950.0 |  |  |  | 5414.123 |
| 267148800.0 |  |  |  | 5385.388 |
| 267496650.0 |  |  |  | 5356.774 |
| 267844500.0 |  |  |  | 5328.281 |
| 268192350.0 |  |  |  | 5299.907 |
| 268540200.0 |  |  |  | 5271.653 |
| 268888050.0 |  |  |  | 5243.519 |
| 269235900.0 |  |  |  | 5215.504 |
| 269583750.0 |  |  |  | 5187.607 |
| 269931600.0 |  |  |  | 5159.829 |
| 270279450.0 |  |  |  | 5132.168 |
| 270627300.0 |  |  |  | 5104.625 |
| 270975150.0 |  |  |  | 5077.199 |
| 271323000.0 |  |  |  | 5049.89 |
| 271670850.0 |  |  |  | 5022.698 |
| 272018700.0 |  |  |  | 4995.622 |
| 272366550.0 |  |  |  | 4968.661 |
| 272714400.0 |  |  |  | 4941.816 |
| 273062250.0 |  |  |  | 4915.086 |
| 273410100.0 |  |  |  | 4888.47 |
| 273757950.0 |  |  |  | 4861.969 |
| 274105800.0 |  |  |  | 4835.582 |
| 274453650.0 |  |  |  | 4809.308 |
| 274801500.0 |  |  |  | 4783.148 |
| 275149350.0 |  |  |  | 4757.101 |
| 275497200.0 |  |  |  | 4731.166 |
| 275845050.0 |  |  |  | 4705.344 |
| 276192900.0 |  |  |  | 4679.633 |
| 276540750.0 |  |  |  | 4654.034 |
| 276888600.0 |  |  |  | 4628.547 |
| 277236450.0 |  |  |  | 4603.17 |
| 277584300.0 |  |  |  | 4577.904 |
| 277932150.0 |  |  |  | 4552.748 |
| 278280000.0 |  |  |  | 4527.701 |
| 278627850.0 |  |  |  | 4502.765 |
| 278975700.0 |  |  |  | 4477.938 |
| 279323550.0 |  |  |  | 4453.219 |
| 279671400.0 |  |  |  | 4428.609 |
| 280019250.0 |  |  |  | 4404.108 |
| 280367100.0 |  |  |  | 4379.714 |
| 280714950.0 |  |  |  | 4355.428 |
| 281062800.0 |  |  |  | 4331.249 |
| 281410650.0 |  |  |  | 4307.177 |
| 281758500.0 |  |  |  | 4283.211 |
| 282106350.0 |  |  |  | 4259.352 |
| 282454200.0 |  |  |  | 4235.599 |
| 282802050.0 |  |  |  | 4211.951 |
| 283149900.0 |  |  |  | 4188.409 |
| 283497750.0 |  |  |  | 4164.972 |
| 283845600.0 |  |  |  | 4141.639 |
| 284193450.0 |  |  |  | 4118.411 |
| 284541300.0 |  |  |  | 4095.287 |
| 284889150.0 |  |  |  | 4072.266 |
| 285237000.0 |  |  |  | 4049.349 |
| 285584850.0 |  |  |  | 4026.535 |
| 285932700.0 |  |  |  | 4003.824 |
| 286280550.0 |  |  |  | 3981.215 |
| 286628400.0 |  |  |  | 3958.708 |
| 286976250.0 |  |  |  | 3936.303 |
| 287324100.0 |  |  |  | 3914 |
| 287671950.0 |  |  |  | 3891.798 |
| 288019800.0 |  |  |  | 3869.696 |
| 288367650.0 |  |  |  | 3847.695 |
| 288715500.0 |  |  |  | 3825.795 |
| 289063350.0 |  |  |  | 3803.994 |
| 289411200.0 |  |  |  | 3782.293 |
| 289759050.0 |  |  |  | 3760.692 |
| 290106900.0 |  |  |  | 3739.189 |
| 290454750.0 |  |  |  | 3717.785 |
| 290802600.0 |  |  |  | 3696.48 |
| 291150450.0 |  |  |  | 3675.273 |
| 291498300.0 |  |  |  | 3654.163 |
| 291846150.0 |  |  |  | 3633.151 |
| 292194000.0 |  |  |  | 3612.236 |
| 292541850.0 |  |  |  | 3591.418 |
| 292889700.0 |  |  |  | 3570.696 |
| 293237550.0 |  |  |  | 3550.071 |
| 293585400.0 |  |  |  | 3529.542 |
| 293933250.0 |  |  |  | 3509.108 |
| 294281100.0 |  |  |  | 3488.77 |
| 294628950.0 |  |  |  | 3468.527 |
| 294976800.0 |  |  |  | 3448.379 |
| 295324650.0 |  |  |  | 3428.325 |
| 295672500.0 |  |  |  | 3408.365 |
| 296020350.0 |  |  |  | 3388.499 |
| 296368200.0 |  |  |  | 3368.726 |
| 296716050.0 |  |  |  | 3349.047 |
| 297063900.0 |  |  |  | 3329.461 |
| 297411750.0 |  |  |  | 3309.967 |
| 297759600.0 |  |  |  | 3290.566 |
| 298107450.0 |  |  |  | 3271.257 |
| 298455300.0 |  |  |  | 3252.039 |
| 298803150.0 |  |  |  | 3232.913 |
| 299151000.0 |  |  |  | 3213.879 |
| 299498850.0 |  |  |  | 3194.935 |
| 299846700.0 |  |  |  | 3176.081 |
| 300194550.0 |  |  |  | 3157.318 |
| 300542400.0 |  |  |  | 3138.645 |
| 300890250.0 |  |  |  | 3120.061 |
| 301238100.0 |  |  |  | 3101.567 |
| 301585950.0 |  |  |  | 3083.162 |
| 301933800.0 |  |  |  | 3064.846 |
| 302281650.0 |  |  |  | 3046.618 |
| 302629500.0 |  |  |  | 3028.479 |
| 302977350.0 |  |  |  | 3010.427 |
| 303325200.0 |  |  |  | 2992.463 |
| 303673050.0 |  |  |  | 2974.586 |
| 304020900.0 |  |  |  | 2956.797 |
| 304368750.0 |  |  |  | 2939.094 |
| 304716600.0 |  |  |  | 2921.477 |
| 305064450.0 |  |  |  | 2903.947 |
| 305412300.0 |  |  |  | 2886.503 |
| 305760150.0 |  |  |  | 2869.144 |
| 306108000.0 |  |  |  | 2851.87 |
| 306455850.0 |  |  |  | 2834.682 |
| 306803700.0 |  |  |  | 2817.578 |
| 307151550.0 |  |  |  | 2800.558 |
| 307499400.0 |  |  |  | 2783.623 |
| 307847250.0 |  |  |  | 2766.771 |
| 308195100.0 |  |  |  | 2750.003 |
| 308542950.0 |  |  |  | 2733.318 |
| 308890800.0 |  |  |  | 2716.717 |
| 309238650.0 |  |  |  | 2700.197 |
| 309586500.0 |  |  |  | 2683.761 |
| 309934350.0 |  |  |  | 2667.406 |
| 310282200.0 |  |  |  | 2651.133 |
| 310630050.0 |  |  |  | 2634.942 |
| 310977900.0 |  |  |  | 2618.832 |
| 311325750.0 |  |  |  | 2602.803 |
| 311673600.0 |  |  |  | 2586.855 |
| 312021450.0 |  |  |  | 2570.987 |
| 312369300.0 |  |  |  | 2555.199 |
| 312717150.0 |  |  |  | 2539.491 |
| 313065000.0 |  |  |  | 2523.862 |
| 313412850.0 |  |  |  | 2508.313 |
| 313760700.0 |  |  |  | 2492.842 |
| 314108550.0 |  |  |  | 2477.451 |
| 314456400.0 |  |  |  | 2462.137 |
| 314804250.0 |  |  |  | 2446.902 |
| 315152100.0 |  |  |  | 2431.745 |
| 315499950.0 |  |  |  | 2416.665 |
| 315847800.0 |  |  |  | 2401.663 |
| 316195650.0 |  |  |  | 2386.737 |
| 316543500.0 |  |  |  | 2371.888 |
| 316891350.0 |  |  |  | 2357.116 |
| 317239200.0 |  |  |  | 2342.419 |
| 317587050.0 |  |  |  | 2327.799 |
| 317934900.0 |  |  |  | 2313.254 |
| 318282750.0 |  |  |  | 2298.785 |
| 318630600.0 |  |  |  | 2284.39 |
| 318978450.0 |  |  |  | 2270.071 |
| 319326300.0 |  |  |  | 2255.825 |
| 319674150.0 |  |  |  | 2241.654 |
| 320022000.0 |  |  |  | 2227.557 |
| 320369850.0 |  |  |  | 2213.534 |
| 320717700.0 |  |  |  | 2199.583 |
| 321065550.0 |  |  |  | 2185.706 |
| 321413400.0 |  |  |  | 2171.902 |
| 321761250.0 |  |  |  | 2158.17 |
| 322109100.0 |  |  |  | 2144.511 |
| 322456950.0 |  |  |  | 2130.923 |
| 322804800.0 |  |  |  | 2117.407 |
| 323152650.0 |  |  |  | 2103.963 |
| 323500500.0 |  |  |  | 2090.59 |
| 323848350.0 |  |  |  | 2077.288 |
| 324196200.0 |  |  |  | 2064.056 |
| 324544050.0 |  |  |  | 2050.894 |
| 324891900.0 |  |  |  | 2037.803 |
| 325239750.0 |  |  |  | 2024.782 |
| 325587600.0 |  |  |  | 2011.829 |
| 325935450.0 |  |  |  | 1998.947 |
| 326283300.0 |  |  |  | 1986.133 |
| 326631150.0 |  |  |  | 1973.388 |
| 326979000.0 |  |  |  | 1960.711 |
| 327326850.0 |  |  |  | 1948.103 |
| 327674700.0 |  |  |  | 1935.562 |
| 328022550.0 |  |  |  | 1923.089 |
| 328370400.0 |  |  |  | 1910.684 |
| 328718250.0 |  |  |  | 1898.345 |
| 329066100.0 |  |  |  | 1886.074 |
| 329413950.0 |  |  |  | 1873.868 |
| 329761800.0 |  |  |  | 1861.73 |
| 330109650.0 |  |  |  | 1849.657 |
| 330457500.0 |  |  |  | 1837.65 |
| 330805350.0 |  |  |  | 1825.708 |
| 331153200.0 |  |  |  | 1813.832 |
| 331501050.0 |  |  |  | 1802.021 |
| 331848900.0 |  |  |  | 1790.274 |
| 332196750.0 |  |  |  | 1778.592 |
| 332544600.0 |  |  |  | 1766.974 |
| 332892450.0 |  |  |  | 1755.42 |
| 333240300.0 |  |  |  | 1743.93 |
| 333588150.0 |  |  |  | 1732.503 |
| 333936000.0 |  |  |  | 1721.139 |
| 334283850.0 |  |  |  | 1709.838 |
| 334631700.0 |  |  |  | 1698.599 |
| 334979550.0 |  |  |  | 1687.423 |
| 335327400.0 |  |  |  | 1676.309 |
| 335675250.0 |  |  |  | 1665.257 |
| 336023100.0 |  |  |  | 1654.267 |
| 336370950.0 |  |  |  | 1643.337 |
| 336718800.0 |  |  |  | 1632.469 |
| 337066650.0 |  |  |  | 1621.662 |
| 337414500.0 |  |  |  | 1610.915 |
| 337762350.0 |  |  |  | 1600.228 |
| 338110200.0 |  |  |  | 1589.602 |
| 338458050.0 |  |  |  | 1579.035 |
| 338805900.0 |  |  |  | 1568.528 |
| 339153750.0 |  |  |  | 1558.08 |
| 339501600.0 |  |  |  | 1547.691 |
| 339849450.0 |  |  |  | 1537.361 |
| 340197300.0 |  |  |  | 1527.089 |
| 340545150.0 |  |  |  | 1516.876 |
| 340893000.0 |  |  |  | 1506.72 |
| 341240850.0 |  |  |  | 1496.623 |
| 341588700.0 |  |  |  | 1486.583 |
| 341936550.0 |  |  |  | 1476.6 |
| 342284400.0 |  |  |  | 1466.674 |
| 342632250.0 |  |  |  | 1456.805 |
| 342980100.0 |  |  |  | 1446.992 |
| 343327950.0 |  |  |  | 1437.236 |
| 343675800.0 |  |  |  | 1427.536 |
| 344023650.0 |  |  |  | 1417.891 |
| 344371500.0 |  |  |  | 1408.302 |
| 344719350.0 |  |  |  | 1398.768 |
| 345067200.0 |  |  |  | 1389.29 |
| 345415050.0 |  |  |  | 1379.866 |
| 345762900.0 |  |  |  | 1370.496 |
| 346110750.0 |  |  |  | 1361.181 |
| 346458600.0 |  |  |  | 1351.921 |
| 346806450.0 |  |  |  | 1342.713 |
| 347154300.0 |  |  |  | 1333.56 |
| 347502150.0 |  |  |  | 1324.46 |
| 347850000.0 |  |  |  | 1315.412 |
| 348197850.0 |  |  |  | 1306.418 |
| 348545700.0 |  |  |  | 1297.477 |
| 348893550.0 |  |  |  | 1288.587 |
| 349241400.0 |  |  |  | 1279.75 |
| 349589250.0 |  |  |  | 1270.965 |
| 349937100.0 |  |  |  | 1262.231 |
| 350284950.0 |  |  |  | 1253.549 |
| 350632800.0 |  |  |  | 1244.918 |
| 350980650.0 |  |  |  | 1236.338 |
| 351328500.0 |  |  |  | 1227.809 |
| 351676350.0 |  |  |  | 1219.33 |
| 352024200.0 |  |  |  | 1210.902 |
| 352372050.0 |  |  |  | 1202.523 |
| 352719900.0 |  |  |  | 1194.195 |
| 353067750.0 |  |  |  | 1185.916 |
| 353415600.0 |  |  |  | 1177.686 |
| 353763450.0 |  |  |  | 1169.505 |
| 354111300.0 |  |  |  | 1161.373 |
| 354459150.0 |  |  |  | 1153.29 |
| 354807000.0 |  |  |  | 1145.256 |
| 355154850.0 |  |  |  | 1137.269 |
| 355502700.0 |  |  |  | 1129.33 |
| 355850550.0 |  |  |  | 1121.44 |
| 356198400.0 |  |  |  | 1113.596 |
| 356546250.0 |  |  |  | 1105.8 |
| 356894100.0 |  |  |  | 1098.051 |
| 357241950.0 |  |  |  | 1090.349 |
| 357589800.0 |  |  |  | 1082.693 |
| 357937650.0 |  |  |  | 1075.084 |
| 358285500.0 |  |  |  | 1067.521 |
| 358633350.0 |  |  |  | 1060.004 |
| 358981200.0 |  |  |  | 1052.533 |
| 359329050.0 |  |  |  | 1045.107 |
| 359676900.0 |  |  |  | 1037.726 |
| 360024750.0 |  |  |  | 1030.391 |
| 360372600.0 |  |  |  | 1023.1 |
| 360720450.0 |  |  |  | 1015.854 |
| 361068300.0 |  |  |  | 1008.652 |
| 361416150.0 |  |  |  | 1001.495 |
| 361764000.0 |  |  |  | 994.381 |
| 362111850.0 |  |  |  | 987.312 |
| 362459700.0 |  |  |  | 980.286 |
| 362807550.0 |  |  |  | 973.303 |
| 363155400.0 |  |  |  | 966.363 |
| 363503250.0 |  |  |  | 959.466 |
| 363851100.0 |  |  |  | 952.612 |
| 364198950.0 |  |  |  | 945.8 |
| 364546800.0 |  |  |  | 939.031 |
| 364894650.0 |  |  |  | 932.304 |
| 365242500.0 |  |  |  | 925.618 |
| 365590350.0 |  |  |  | 918.975 |
| 365938200.0 |  |  |  | 912.372 |
| 366286050.0 |  |  |  | 905.811 |
| 366633900.0 |  |  |  | 899.291 |
| 366981750.0 |  |  |  | 892.812 |
| 367329600.0 |  |  |  | 886.373 |
| 367677450.0 |  |  |  | 879.974 |
| 368025300.0 |  |  |  | 873.616 |
| 368373150.0 |  |  |  | 867.298 |
| 368721000.0 |  |  |  | 861.02 |
| 369068850.0 |  |  |  | 854.781 |
| 369416700.0 |  |  |  | 848.582 |
| 369764550.0 |  |  |  | 842.422 |
| 370112400.0 |  |  |  | 836.3 |
| 370460250.0 |  |  |  | 830.218 |
| 370808100.0 |  |  |  | 824.174 |
| 371155950.0 |  |  |  | 818.169 |
| 371503800.0 |  |  |  | 812.202 |
| 371851650.0 |  |  |  | 806.272 |
| 372199500.0 |  |  |  | 800.381 |
| 372547350.0 |  |  |  | 794.527 |
| 372895200.0 |  |  |  | 788.711 |
| 373243050.0 |  |  |  | 782.931 |
| 373590900.0 |  |  |  | 777.189 |
| 373938750.0 |  |  |  | 771.484 |
| 374286600.0 |  |  |  | 765.815 |
| 374634450.0 |  |  |  | 760.183 |
| 374982300.0 |  |  |  | 754.587 |
| 375330150.0 |  |  |  | 749.027 |
| 375678000.0 |  |  |  | 743.502 |
| 376025850.0 |  |  |  | 738.014 |
| 376373700.0 |  |  |  | 732.561 |
| 376721550.0 |  |  |  | 727.143 |
| 377069400.0 |  |  |  | 721.761 |
| 377417250.0 |  |  |  | 716.413 |
| 377765100.0 |  |  |  | 711.1 |
| 378112950.0 |  |  |  | 705.822 |
| 378460800.0 |  |  |  | 700.578 |
| 378808650.0 |  |  |  | 695.368 |
| 379156500.0 |  |  |  | 690.192 |
| 379504350.0 |  |  |  | 685.051 |
| 379852200.0 |  |  |  | 679.942 |
| 380200050.0 |  |  |  | 674.867 |
| 380547900.0 |  |  |  | 669.826 |
| 380895750.0 |  |  |  | 664.817 |
| 381243600.0 |  |  |  | 659.842 |
| 381591450.0 |  |  |  | 654.899 |
| 381939300.0 |  |  |  | 649.989 |
| 382287150.0 |  |  |  | 645.111 |
| 382635000.0 |  |  |  | 640.266 |
| 382982850.0 |  |  |  | 635.452 |
| 383330700.0 |  |  |  | 630.67 |
| 383678550.0 |  |  |  | 625.92 |
| 384026400.0 |  |  |  | 621.202 |
| 384374250.0 |  |  |  | 616.515 |
| 384722100.0 |  |  |  | 611.859 |
| 385069950.0 |  |  |  | 607.234 |
| 385417800.0 |  |  |  | 602.64 |
| 385765650.0 |  |  |  | 598.076 |
| 386113500.0 |  |  |  | 593.543 |
| 386461350.0 |  |  |  | 589.04 |
| 386809200.0 |  |  |  | 584.568 |
| 387157050.0 |  |  |  | 580.125 |
| 387504900.0 |  |  |  | 575.713 |
| 387852750.0 |  |  |  | 571.329 |
| 388200600.0 |  |  |  | 566.976 |
| 388548450.0 |  |  |  | 562.651 |
| 388896300.0 |  |  |  | 558.356 |
| 389244150.0 |  |  |  | 554.09 |
| 389592000.0 |  |  |  | 549.853 |
| 389939850.0 |  |  |  | 545.644 |
| 390287700.0 |  |  |  | 541.464 |
| 390635550.0 |  |  |  | 537.312 |
| 390983400.0 |  |  |  | 533.188 |
| 391331250.0 |  |  |  | 529.093 |
| 391679100.0 |  |  |  | 525.025 |
| 392026950.0 |  |  |  | 520.985 |
| 392374800.0 |  |  |  | 516.972 |
| 392722650.0 |  |  |  | 512.987 |
| 393070500.0 |  |  |  | 509.029 |
| 393418350.0 |  |  |  | 505.098 |
| 393766200.0 |  |  |  | 501.194 |
| 394114050.0 |  |  |  | 497.317 |
| 394461900.0 |  |  |  | 493.466 |
| 394809750.0 |  |  |  | 489.642 |
| 395157600.0 |  |  |  | 485.844 |
| 395505450.0 |  |  |  | 482.073 |
| 395853300.0 |  |  |  | 478.327 |
| 396201150.0 |  |  |  | 474.607 |
| 396549000.0 |  |  |  | 470.913 |
| 396896850.0 |  |  |  | 467.244 |
| 397244700.0 |  |  |  | 463.601 |
| 397592550.0 |  |  |  | 459.983 |
| 397940400.0 |  |  |  | 456.39 |
| 398288250.0 |  |  |  | 452.822 |
| 398636100.0 |  |  |  | 449.279 |
| 398983950.0 |  |  |  | 445.761 |
| 399331800.0 |  |  |  | 442.267 |
| 399679650.0 |  |  |  | 438.798 |
| 400027500.0 |  |  |  | 435.352 |
| 400375350.0 |  |  |  | 431.931 |
| 400723200.0 |  |  |  | 428.534 |
| 401071050.0 |  |  |  | 425.16 |
| 401418900.0 |  |  |  | 421.81 |
| 401766750.0 |  |  |  | 418.484 |
| 402114600.0 |  |  |  | 415.181 |
| 402462450.0 |  |  |  | 411.902 |
| 402810300.0 |  |  |  | 408.645 |
| 403158150.0 |  |  |  | 405.411 |
| 403506000.0 |  |  |  | 402.201 |
| 403853850.0 |  |  |  | 399.013 |
| 404201700.0 |  |  |  | 395.847 |
| 404549550.0 |  |  |  | 392.704 |
| 404897400.0 |  |  |  | 389.583 |
| 405245250.0 |  |  |  | 386.484 |
| 405593100.0 |  |  |  | 383.408 |
| 405940950.0 |  |  |  | 380.353 |
| 406288800.0 |  |  |  | 377.32 |
| 406636650.0 |  |  |  | 374.309 |
| 406984500.0 |  |  |  | 371.319 |
| 407332350.0 |  |  |  | 368.35 |
| 407680200.0 |  |  |  | 365.403 |
| 408028050.0 |  |  |  | 362.476 |
| 408375900.0 |  |  |  | 359.571 |
| 408723750.0 |  |  |  | 356.687 |
| 409071600.0 |  |  |  | 353.823 |
| 409419450.0 |  |  |  | 350.98 |
| 409767300.0 |  |  |  | 348.157 |
| 410115150.0 |  |  |  | 345.355 |
| 410463000.0 |  |  |  | 342.572 |
| 410810850.0 |  |  |  | 339.81 |
| 411158700.0 |  |  |  | 337.068 |
| 411506550.0 |  |  |  | 334.346 |
| 411854400.0 |  |  |  | 331.643 |
| 412202250.0 |  |  |  | 328.96 |
| 412550100.0 |  |  |  | 326.297 |
| 412897950.0 |  |  |  | 323.653 |
| 413245800.0 |  |  |  | 321.028 |
| 413593650.0 |  |  |  | 318.422 |
| 413941500.0 |  |  |  | 315.835 |
| 414289350.0 |  |  |  | 313.267 |
| 414637200.0 |  |  |  | 310.718 |
| 414985050.0 |  |  |  | 308.187 |
| 415332900.0 |  |  |  | 305.675 |
| 415680750.0 |  |  |  | 303.181 |
| 416028600.0 |  |  |  | 300.706 |
| 416376450.0 |  |  |  | 298.248 |
| 416724300.0 |  |  |  | 295.809 |
| 417072150.0 |  |  |  | 293.388 |
| 417420000.0 |  |  |  | 290.984 |
| 417767850.0 |  |  |  | 288.598 |
| 418115700.0 |  |  |  | 286.23 |
| 418463550.0 |  |  |  | 283.88 |
| 418811400.0 |  |  |  | 281.546 |
| 419159250.0 |  |  |  | 279.23 |
| 419507100.0 |  |  |  | 276.931 |
| 419854950.0 |  |  |  | 274.649 |
| 420202800.0 |  |  |  | 272.384 |
| 420550650.0 |  |  |  | 270.136 |
| 420898500.0 |  |  |  | 267.905 |
| 421246350.0 |  |  |  | 265.69 |
| 421594200.0 |  |  |  | 263.492 |
| 421942050.0 |  |  |  | 261.31 |
| 422289900.0 |  |  |  | 259.144 |
| 422637750.0 |  |  |  | 256.995 |
| 422985600.0 |  |  |  | 254.861 |
| 423333450.0 |  |  |  | 252.744 |
| 423681300.0 |  |  |  | 250.642 |
| 424029150.0 |  |  |  | 248.557 |
| 424377000.0 |  |  |  | 246.487 |
| 424724850.0 |  |  |  | 244.432 |
| 425072700.0 |  |  |  | 242.393 |
| 425420550.0 |  |  |  | 240.369 |
| 425768400.0 |  |  |  | 238.361 |
| 426116250.0 |  |  |  | 236.367 |
| 426464100.0 |  |  |  | 234.389 |
| 426811950.0 |  |  |  | 232.426 |
| 427159800.0 |  |  |  | 230.478 |
| 427507650.0 |  |  |  | 228.544 |
| 427855500.0 |  |  |  | 226.625 |
| 428203350.0 |  |  |  | 224.72 |
| 428551200.0 |  |  |  | 222.831 |
| 428899050.0 |  |  |  | 220.955 |
| 429246900.0 |  |  |  | 219.094 |
| 429594750.0 |  |  |  | 217.247 |
| 429942600.0 |  |  |  | 215.414 |
| 430290450.0 |  |  |  | 213.594 |
| 430638300.0 |  |  |  | 211.789 |
| 430986150.0 |  |  |  | 209.998 |
| 431334000.0 |  |  |  | 208.22 |
| 431681850.0 |  |  |  | 206.457 |
| 432029700.0 |  |  |  | 204.706 |
| 432377550.0 |  |  |  | 202.969 |
| 432725400.0 |  |  |  | 201.246 |
| 433073250.0 |  |  |  | 199.535 |
| 433421100.0 |  |  |  | 197.838 |
| 433768950.0 |  |  |  | 196.154 |
| 434116800.0 |  |  |  | 194.483 |
| 434464650.0 |  |  |  | 192.825 |
| 434812500.0 |  |  |  | 191.179 |
| 435160350.0 |  |  |  | 189.547 |
| 435508200.0 |  |  |  | 187.927 |
| 435856050.0 |  |  |  | 186.319 |
| 436203900.0 |  |  |  | 184.724 |
| 436551750.0 |  |  |  | 183.142 |
| 436899600.0 |  |  |  | 181.572 |
| 437247450.0 |  |  |  | 180.014 |
| 437595300.0 |  |  |  | 178.468 |
| 437943150.0 |  |  |  | 176.934 |
| 438291000.0 |  |  |  | 175.412 |
| 438638850.0 |  |  |  | 173.902 |
| 438986700.0 |  |  |  | 172.404 |
| 439334550.0 |  |  |  | 170.918 |
| 439682400.0 |  |  |  | 169.443 |
| 440030250.0 |  |  |  | 167.98 |
| 440378100.0 |  |  |  | 166.528 |
| 440725950.0 |  |  |  | 165.088 |
| 441073800.0 |  |  |  | 163.659 |
| 441421650.0 |  |  |  | 162.241 |
| 441769500.0 |  |  |  | 160.835 |
| 442117350.0 |  |  |  | 159.439 |
| 442465200.0 |  |  |  | 158.055 |
| 442813050.0 |  |  |  | 156.681 |
| 443160900.0 |  |  |  | 155.319 |
| 443508750.0 |  |  |  | 153.967 |
| 443856600.0 |  |  |  | 152.626 |
| 444204450.0 |  |  |  | 151.295 |
| 444552300.0 |  |  |  | 149.976 |
| 444900150.0 |  |  |  | 148.666 |
| 445248000.0 |  |  |  | 147.367 |
| 445595850.0 |  |  |  | 146.079 |
| 445943700.0 |  |  |  | 144.8 |
| 446291550.0 |  |  |  | 143.532 |
| 446639400.0 |  |  |  | 142.274 |
| 446987250.0 |  |  |  | 141.026 |
| 447335100.0 |  |  |  | 139.788 |
| 447682950.0 |  |  |  | 138.56 |
| 448030800.0 |  |  |  | 137.342 |
| 448378650.0 |  |  |  | 136.133 |
| 448726500.0 |  |  |  | 134.935 |
| 449074350.0 |  |  |  | 133.745 |
| 449422200.0 |  |  |  | 132.566 |
| 449770050.0 |  |  |  | 131.396 |
| 450117900.0 |  |  |  | 130.235 |
| 450465750.0 |  |  |  | 129.084 |
| 450813600.0 |  |  |  | 127.942 |
| 451161450.0 |  |  |  | 126.809 |
| 451509300.0 |  |  |  | 125.686 |
| 451857150.0 |  |  |  | 124.571 |
| 452205000.0 |  |  |  | 123.466 |
| 452552850.0 |  |  |  | 122.369 |
| 452900700.0 |  |  |  | 121.282 |
| 453248550.0 |  |  |  | 120.203 |
| 453596400.0 |  |  |  | 119.133 |
| 453944250.0 |  |  |  | 118.072 |
| 454292100.0 |  |  |  | 117.019 |
| 454639950.0 |  |  |  | 115.975 |
| 454987800.0 |  |  |  | 114.94 |
| 455335650.0 |  |  |  | 113.913 |
| 455683500.0 |  |  |  | 112.894 |
| 456031350.0 |  |  |  | 111.884 |
| 456379200.0 |  |  |  | 110.882 |
| 456727050.0 |  |  |  | 109.888 |
| 457074900.0 |  |  |  | 108.902 |
| 457422750.0 |  |  |  | 107.925 |
| 457770600.0 |  |  |  | 106.955 |
| 458118450.0 |  |  |  | 105.994 |
| 458466300.0 |  |  |  | 105.04 |
| 458814150.0 |  |  |  | 104.094 |
| 459162000.0 |  |  |  | 103.156 |
| 459509850.0 |  |  |  | 102.226 |
| 459857700.0 |  |  |  | 101.304 |
| 460205550.0 |  |  |  | 100.389 |
| 460553400.0 |  |  |  | 99.481 |
| 460901250.0 |  |  |  | 98.582 |
| 461249100.0 |  |  |  | 97.689 |
| 461596950.0 |  |  |  | 96.804 |
| 461944800.0 |  |  |  | 95.927 |
| 462292650.0 |  |  |  | 95.057 |
| 462640500.0 |  |  |  | 94.194 |
| 462988350.0 |  |  |  | 93.338 |
| 463336200.0 |  |  |  | 92.489 |
| 463684050.0 |  |  |  | 91.647 |
| 464031900.0 |  |  |  | 90.813 |
| 464379750.0 |  |  |  | 89.985 |
| 464727600.0 |  |  |  | 89.165 |
| 465075450.0 |  |  |  | 88.351 |
| 465423300.0 |  |  |  | 87.544 |
| 465771150.0 |  |  |  | 86.744 |
| 466119000.0 |  |  |  | 85.95 |
| 466466850.0 |  |  |  | 85.163 |
| 466814700.0 |  |  |  | 84.383 |
| 467162550.0 |  |  |  | 83.61 |
| 467510400.0 |  |  |  | 82.843 |
| 467858250.0 |  |  |  | 82.082 |
| 468206100.0 |  |  |  | 81.328 |
| 468553950.0 |  |  |  | 80.58 |
| 468901800.0 |  |  |  | 79.838 |
| 469249650.0 |  |  |  | 79.103 |
| 469597500.0 |  |  |  | 78.374 |
| 469945350.0 |  |  |  | 77.651 |
| 470293200.0 |  |  |  | 76.935 |
| 470641050.0 |  |  |  | 76.224 |
| 470988900.0 |  |  |  | 75.52 |
| 471336750.0 |  |  |  | 74.821 |
| 471684600.0 |  |  |  | 74.128 |
| 472032450.0 |  |  |  | 73.442 |
| 472380300.0 |  |  |  | 72.761 |
| 472728150.0 |  |  |  | 72.086 |
| 473076000.0 |  |  |  | 71.417 |
| 473423850.0 |  |  |  | 70.753 |
| 473771700.0 |  |  |  | 70.095 |
| 474119550.0 |  |  |  | 69.443 |
| 474467400.0 |  |  |  | 68.796 |
| 474815250.0 |  |  |  | 68.155 |
| 475163100.0 |  |  |  | 67.52 |
| 475510950.0 |  |  |  | 66.89 |
| 475858800.0 |  |  |  | 66.265 |
| 476206650.0 |  |  |  | 65.646 |
| 476554500.0 |  |  |  | 65.032 |
| 476902350.0 |  |  |  | 64.423 |
| 477250200.0 |  |  |  | 63.82 |
| 477598050.0 |  |  |  | 63.221 |
| 477945900.0 |  |  |  | 62.628 |
| 478293750.0 |  |  |  | 62.04 |
| 478641600.0 |  |  |  | 61.458 |
| 478989450.0 |  |  |  | 60.88 |
| 479337300.0 |  |  |  | 60.307 |
| 479685150.0 |  |  |  | 59.739 |
| 480033000.0 |  |  |  | 59.177 |
| 480380850.0 |  |  |  | 58.619 |
| 480728700.0 |  |  |  | 58.066 |
| 481076550.0 |  |  |  | 57.517 |
| 481424400.0 |  |  |  | 56.974 |
| 481772250.0 |  |  |  | 56.435 |
| 482120100.0 |  |  |  | 55.901 |
| 482467950.0 |  |  |  | 55.372 |
| 482815800.0 |  |  |  | 54.847 |
| 483163650.0 |  |  |  | 54.327 |
| 483511500.0 |  |  |  | 53.811 |
| 483859350.0 |  |  |  | 53.3 |
| 484207200.0 |  |  |  | 52.794 |
| 484555050.0 |  |  |  | 52.292 |
| 484902900.0 |  |  |  | 51.794 |
| 485250750.0 |  |  |  | 51.301 |
| 485598600.0 |  |  |  | 50.812 |
| 485946450.0 |  |  |  | 50.327 |
| 486294300.0 |  |  |  | 49.847 |
| 486642150.0 |  |  |  | 49.37 |
| 486990000.0 |  |  |  | 48.899 |
| 487337850.0 |  |  |  | 48.431 |
| 487685700.0 |  |  |  | 47.967 |
| 488033550.0 |  |  |  | 47.508 |
| 488381400.0 |  |  |  | 47.052 |
| 488729250.0 |  |  |  | 46.601 |
| 489077100.0 |  |  |  | 46.153 |
| 489424950.0 |  |  |  | 45.71 |
| 489772800.0 |  |  |  | 45.271 |
| 490120650.0 |  |  |  | 44.835 |
| 490468500.0 |  |  |  | 44.403 |
| 490816350.0 |  |  |  | 43.976 |
| 491164200.0 |  |  |  | 43.552 |
| 491512050.0 |  |  |  | 43.131 |
| 491859900.0 |  |  |  | 42.715 |
| 492207750.0 |  |  |  | 42.302 |
| 492555600.0 |  |  |  | 41.893 |
| 492903450.0 |  |  |  | 41.488 |
| 493251300.0 |  |  |  | 41.086 |
| 493599150.0 |  |  |  | 40.688 |
| 493947000.0 |  |  |  | 40.294 |
| 494294850.0 |  |  |  | 39.903 |
| 494642700.0 |  |  |  | 39.515 |
| 494990550.0 |  |  |  | 39.131 |
| 495338400.0 |  |  |  | 38.751 |
| 495686250.0 |  |  |  | 38.373 |
| 496034100.0 |  |  |  | 38 |
| 496381950.0 |  |  |  | 37.629 |
| 496729800.0 |  |  |  | 37.263 |
| 497077650.0 |  |  |  | 36.899 |
| 497425500.0 |  |  |  | 36.539 |
| 497773350.0 |  |  |  | 36.181 |
| 498121200.0 |  |  |  | 35.828 |
| 498469050.0 |  |  |  | 35.477 |
| 498816900.0 |  |  |  | 35.13 |
| 499164750.0 |  |  |  | 34.785 |
| 499512600.0 |  |  |  | 34.444 |
| 499860450.0 |  |  |  | 34.106 |
| 500208300.0 |  |  |  | 33.771 |
| 500556150.0 |  |  |  | 33.439 |
| 500904000.0 |  |  |  | 33.11 |
| 501251850.0 |  |  |  | 32.784 |
| 501599700.0 |  |  |  | 32.462 |
| 501947550.0 |  |  |  | 32.142 |
| 502295400.0 |  |  |  | 31.825 |
| 502643250.0 |  |  |  | 31.511 |
| 502991100.0 |  |  |  | 31.199 |
| 503338950.0 |  |  |  | 30.891 |
| 503686800.0 |  |  |  | 30.585 |
| 504034650.0 |  |  |  | 30.283 |
| 504382500.0 |  |  |  | 29.983 |
| 504730350.0 |  |  |  | 29.686 |
| 505078200.0 |  |  |  | 29.391 |
| 505426050.0 |  |  |  | 29.1 |
| 505773900.0 |  |  |  | 28.81 |
| 506121750.0 |  |  |  | 28.524 |
| 506469600.0 |  |  |  | 28.24 |
| 506817450.0 |  |  |  | 27.959 |
| 507165300.0 |  |  |  | 27.681 |
| 507513150.0 |  |  |  | 27.405 |
| 507861000.0 |  |  |  | 27.132 |
| 508208850.0 |  |  |  | 26.861 |
| 508556700.0 |  |  |  | 26.593 |
| 508904550.0 |  |  |  | 26.327 |
| 509252400.0 |  |  |  | 26.063 |
| 509600250.0 |  |  |  | 25.803 |
| 509948100.0 |  |  |  | 25.544 |
| 510295950.0 |  |  |  | 25.288 |
| 510643800.0 |  |  |  | 25.035 |
| 510991650.0 |  |  |  | 24.783 |
| 511339500.0 |  |  |  | 24.534 |
| 511687350.0 |  |  |  | 24.288 |
| 512035200.0 |  |  |  | 24.044 |
| 512383050.0 |  |  |  | 23.802 |
| 512730900.0 |  |  |  | 23.562 |
| 513078750.0 |  |  |  | 23.324 |
| 513426600.0 |  |  |  | 23.089 |
| 513774450.0 |  |  |  | 22.856 |
| 514122300.0 |  |  |  | 22.625 |
| 514470150.0 |  |  |  | 22.397 |
| 514818000.0 |  |  |  | 22.17 |
| 515165850.0 |  |  |  | 21.946 |
| 515513700.0 |  |  |  | 21.723 |
| 515861550.0 |  |  |  | 21.503 |
| 516209400.0 |  |  |  | 21.285 |
| 516557250.0 |  |  |  | 21.069 |
| 516905100.0 |  |  |  | 20.855 |
| 517252950.0 |  |  |  | 20.643 |
| 517600800.0 |  |  |  | 20.433 |
| 517948650.0 |  |  |  | 20.225 |
| 518296500.0 |  |  |  | 20.019 |
| 518644350.0 |  |  |  | 19.815 |
| 518992200.0 |  |  |  | 19.613 |
| 519340050.0 |  |  |  | 19.413 |
| 519687900.0 |  |  |  | 19.215 |
| 520035750.0 |  |  |  | 19.019 |
| 520383600.0 |  |  |  | 18.824 |
| 520731450.0 |  |  |  | 18.631 |
| 521079300.0 |  |  |  | 18.441 |
| 521427150.0 |  |  |  | 18.252 |
| 521775000.0 |  |  |  | 18.065 |
| 522122850.0 |  |  |  | 17.879 |
| 522470700.0 |  |  |  | 17.696 |
| 522818550.0 |  |  |  | 17.514 |
| 523166400.0 |  |  |  | 17.334 |
| 523514250.0 |  |  |  | 17.155 |
| 523862100.0 |  |  |  | 16.979 |
| 524209950.0 |  |  |  | 16.804 |
| 524557800.0 |  |  |  | 16.63 |
| 524905650.0 |  |  |  | 16.459 |
| 525253500.0 |  |  |  | 16.289 |
| 525601350.0 |  |  |  | 16.121 |
| 525949200.0 |  |  |  | 15.954 |
| 526297050.0 |  |  |  | 15.789 |
| 526644900.0 |  |  |  | 15.625 |
| 526992750.0 |  |  |  | 15.464 |
| 527340600.0 |  |  |  | 15.303 |
| 527688450.0 |  |  |  | 15.144 |
| 528036300.0 |  |  |  | 14.987 |
| 528384150.0 |  |  |  | 14.832 |
| 528732000.0 |  |  |  | 14.677 |
| 529079850.0 |  |  |  | 14.525 |
| 529427700.0 |  |  |  | 14.373 |
| 529775550.0 |  |  |  | 14.224 |
| 530123400.0 |  |  |  | 14.075 |
| 530471250.0 |  |  |  | 13.929 |
| 530819100.0 |  |  |  | 13.783 |
| 531166950.0 |  |  |  | 13.639 |
| 531514800.0 |  |  |  | 13.497 |
| 531862650.0 |  |  |  | 13.355 |
| 532210500.0 |  |  |  | 13.216 |
| 532558350.0 |  |  |  | 13.077 |
| 532906200.0 |  |  |  | 12.94 |
| 533254050.0 |  |  |  | 12.804 |
| 533601900.0 |  |  |  | 12.67 |
| 533949750.0 |  |  |  | 12.537 |
| 534297600.0 |  |  |  | 12.405 |
| 534645450.0 |  |  |  | 12.275 |
| 534993300.0 |  |  |  | 12.145 |
| 535341150.0 |  |  |  | 12.018 |
| 535689000.0 |  |  |  | 11.891 |
| 536036850.0 |  |  |  | 11.766 |
| 536384700.0 |  |  |  | 11.641 |
| 536732550.0 |  |  |  | 11.518 |
| 537080400.0 |  |  |  | 11.397 |
| 537428250.0 |  |  |  | 11.276 |
| 537776100.0 |  |  |  | 11.157 |
| 538123950.0 |  |  |  | 11.039 |
| 538471800.0 |  |  |  | 10.922 |
| 538819650.0 |  |  |  | 10.806 |
| 539167500.0 |  |  |  | 10.691 |
| 539515350.0 |  |  |  | 10.578 |
| 539863200.0 |  |  |  | 10.465 |
| 540211050.0 |  |  |  | 10.354 |
| 540558900.0 |  |  |  | 10.244 |
| 540906750.0 |  |  |  | 10.135 |
| 541254600.0 |  |  |  | 10.027 |
| 541602450.0 |  |  |  | 9.92 |
| 541950300.0 |  |  |  | 9.814 |
| 542298150.0 |  |  |  | 9.709 |
| 542646000.0 |  |  |  | 9.605 |
| 542993850.0 |  |  |  | 9.503 |
| 543341700.0 |  |  |  | 9.401 |
| 543689550.0 |  |  |  | 9.3 |
| 544037400.0 |  |  |  | 9.201 |
| 544385250.0 |  |  |  | 9.102 |
| 544733100.0 |  |  |  | 9.004 |
| 545080950.0 |  |  |  | 8.908 |
| 545428800.0 |  |  |  | 8.812 |
| 545776650.0 |  |  |  | 8.717 |
| 546124500.0 |  |  |  | 8.623 |
| 546472350.0 |  |  |  | 8.531 |
| 546820200.0 |  |  |  | 8.439 |
| 547168050.0 |  |  |  | 8.348 |
| 547515900.0 |  |  |  | 8.258 |
| 547863750.0 |  |  |  | 8.168 |
| 548211600.0 |  |  |  | 8.08 |
| 548559450.0 |  |  |  | 7.993 |
| 548907300.0 |  |  |  | 7.906 |
| 549255150.0 |  |  |  | 7.821 |
| 549603000.0 |  |  |  | 7.736 |
| 549950850.0 |  |  |  | 7.652 |
| 550298700.0 |  |  |  | 7.569 |
| 550646550.0 |  |  |  | 7.487 |
| 550994400.0 |  |  |  | 7.406 |
| 551342250.0 |  |  |  | 7.325 |
| 551690100.0 |  |  |  | 7.245 |
| 552037950.0 |  |  |  | 7.167 |
| 552385800.0 |  |  |  | 7.089 |
| 552733650.0 |  |  |  | 7.011 |
| 553081500.0 |  |  |  | 6.935 |
| 553429350.0 |  |  |  | 6.859 |
| 553777200.0 |  |  |  | 6.784 |
| 554125050.0 |  |  |  | 6.71 |
| 554472900.0 |  |  |  | 6.637 |
| 554820750.0 |  |  |  | 6.564 |
| 555168600.0 |  |  |  | 6.492 |
| 555516450.0 |  |  |  | 6.421 |
| 555864300.0 |  |  |  | 6.35 |
| 556212150.0 |  |  |  | 6.281 |
| 556560000.0 |  |  |  | 6.212 |
| 556907850.0 |  |  |  | 6.143 |
| 557255700.0 |  |  |  | 6.076 |
| 557603550.0 |  |  |  | 6.009 |
| 557951400.0 |  |  |  | 5.943 |
| 558299250.0 |  |  |  | 5.877 |
| 558647100.0 |  |  |  | 5.812 |
| 558994950.0 |  |  |  | 5.748 |
| 559342800.0 |  |  |  | 5.685 |
| 559690650.0 |  |  |  | 5.622 |
| 560038500.0 |  |  |  | 5.56 |
| 560386350.0 |  |  |  | 5.498 |
| 560734200.0 |  |  |  | 5.437 |
| 561082050.0 |  |  |  | 5.377 |
| 561429900.0 |  |  |  | 5.317 |
| 561777750.0 |  |  |  | 5.258 |
| 562125600.0 |  |  |  | 5.2 |
| 562473450.0 |  |  |  | 5.142 |
| 562821300.0 |  |  |  | 5.085 |
| 563169150.0 |  |  |  | 5.028 |
| 563517000.0 |  |  |  | 4.972 |
| 563864850.0 |  |  |  | 4.917 |
| 564212700.0 |  |  |  | 4.862 |
| 564560550.0 |  |  |  | 4.808 |
| 564908400.0 |  |  |  | 4.754 |
| 565256250.0 |  |  |  | 4.701 |
| 565604100.0 |  |  |  | 4.648 |
| 565951950.0 |  |  |  | 4.596 |
| 566299800.0 |  |  |  | 4.545 |
| 566647650.0 |  |  |  | 4.494 |
| 566995500.0 |  |  |  | 4.443 |
| 567343350.0 |  |  |  | 4.393 |
| 567691200.0 |  |  |  | 4.344 |
| 568039050.0 |  |  |  | 4.295 |
| 568386900.0 |  |  |  | 4.247 |
| 568734750.0 |  |  |  | 4.199 |
| 569082600.0 |  |  |  | 4.152 |
| 569430450.0 |  |  |  | 4.105 |
| 569778300.0 |  |  |  | 4.058 |
| 570126150.0 |  |  |  | 4.013 |
| 570474000.0 |  |  |  | 3.967 |
| 570821850.0 |  |  |  | 3.922 |
| 571169700.0 |  |  |  | 3.878 |
| 571517550.0 |  |  |  | 3.834 |
| 571865400.0 |  |  |  | 3.791 |
| 572213250.0 |  |  |  | 3.748 |
| 572561100.0 |  |  |  | 3.705 |
| 572908950.0 |  |  |  | 3.663 |
| 573256800.0 |  |  |  | 3.621 |
| 573604650.0 |  |  |  | 3.58 |
| 573952500.0 |  |  |  | 3.539 |
| 574300350.0 |  |  |  | 3.499 |
| 574648200.0 |  |  |  | 3.459 |
| 574996050.0 |  |  |  | 3.42 |
| 575343900.0 |  |  |  | 3.38 |
| 575691750.0 |  |  |  | 3.342 |
| 576039600.0 |  |  |  | 3.304 |
| 576387450.0 |  |  |  | 3.266 |
| 576735300.0 |  |  |  | 3.228 |
| 577083150.0 |  |  |  | 3.191 |
| 577431000.0 |  |  |  | 3.155 |
| 577778850.0 |  |  |  | 3.119 |
| 578126700.0 |  |  |  | 3.083 |
| 578474550.0 |  |  |  | 3.047 |
| 578822400.0 |  |  |  | 3.012 |
| 579170250.0 |  |  |  | 2.977 |
| 579518100.0 |  |  |  | 2.943 |
| 579865950.0 |  |  |  | 2.909 |
| 580213800.0 |  |  |  | 2.876 |
| 580561650.0 |  |  |  | 2.842 |
| 580909500.0 |  |  |  | 2.81 |
| 581257350.0 |  |  |  | 2.777 |
| 581605200.0 |  |  |  | 2.745 |
| 581953050.0 |  |  |  | 2.713 |
| 582300900.0 |  |  |  | 2.682 |
| 582648750.0 |  |  |  | 2.65 |
| 582996600.0 |  |  |  | 2.62 |
| 583344450.0 |  |  |  | 2.589 |
| 583692300.0 |  |  |  | 2.559 |
| 584040150.0 |  |  |  | 2.529 |
| 584388000.0 |  |  |  | 2.5 |
| 584735850.0 |  |  |  | 2.471 |
| 585083700.0 |  |  |  | 2.442 |
| 585431550.0 |  |  |  | 2.413 |
| 585779400.0 |  |  |  | 2.385 |
| 586127250.0 |  |  |  | 2.357 |
| 586475100.0 |  |  |  | 2.33 |
| 586822950.0 |  |  |  | 2.302 |
| 587170800.0 |  |  |  | 2.275 |
| 587518650.0 |  |  |  | 2.249 |
| 587866500.0 |  |  |  | 2.222 |
| 588214350.0 |  |  |  | 2.196 |
| 588562200.0 |  |  |  | 2.17 |
| 588910050.0 |  |  |  | 2.145 |
| 589257900.0 |  |  |  | 2.119 |
| 589605750.0 |  |  |  | 2.094 |
| 589953600.0 |  |  |  | 2.07 |
| 590301450.0 |  |  |  | 2.045 |
| 590649300.0 |  |  |  | 2.021 |
| 590997150.0 |  |  |  | 1.997 |
| 591345000.0 |  |  |  | 1.973 |
| 591692850.0 |  |  |  | 1.95 |
| 592040700.0 |  |  |  | 1.927 |
| 592388550.0 |  |  |  | 1.904 |
| 592736400.0 |  |  |  | 1.881 |
| 593084250.0 |  |  |  | 1.859 |
| 593432100.0 |  |  |  | 1.837 |
| 593779950.0 |  |  |  | 1.815 |
| 594127800.0 |  |  |  | 1.793 |
| 594475650.0 |  |  |  | 1.772 |
| 594823500.0 |  |  |  | 1.751 |
| 595171350.0 |  |  |  | 1.73 |
| 595519200.0 |  |  |  | 1.709 |
| 595867050.0 |  |  |  | 1.689 |
| 596214900.0 |  |  |  | 1.668 |
| 596562750.0 |  |  |  | 1.648 |
| 596910600.0 |  |  |  | 1.629 |
| 597258450.0 |  |  |  | 1.609 |
| 597606300.0 |  |  |  | 1.59 |
| 597954150.0 |  |  |  | 1.57 |
| 598302000.0 |  |  |  | 1.552 |
| 598649850.0 |  |  |  | 1.533 |
| 598997700.0 |  |  |  | 1.514 |
| 599345550.0 |  |  |  | 1.496 |
| 599693400.0 |  |  |  | 1.478 |
| 600041250.0 |  |  |  | 1.46 |
| 600389100.0 |  |  |  | 1.442 |
| 600736950.0 |  |  |  | 1.425 |
| 601084800.0 |  |  |  | 1.407 |
| 601432650.0 |  |  |  | 1.39 |
| 601780500.0 |  |  |  | 1.373 |
| 602128350.0 |  |  |  | 1.357 |
| 602476200.0 |  |  |  | 1.34 |
| 602824050.0 |  |  |  | 1.324 |
| 603171900.0 |  |  |  | 1.308 |
| 603519750.0 |  |  |  | 1.292 |
| 603867600.0 |  |  |  | 1.276 |
| 604215450.0 |  |  |  | 1.26 |
| 604563300.0 |  |  |  | 1.245 |
| 604911150.0 |  |  |  | 1.229 |
| 605259000.0 |  |  |  | 1.214 |
| 605606850.0 |  |  |  | 1.199 |
| 605954700.0 |  |  |  | 1.185 |
| 606302550.0 |  |  |  | 1.17 |
| 606650400.0 |  |  |  | 1.156 |
| 606998250.0 |  |  |  | 1.141 |
| 607346100.0 |  |  |  | 1.127 |
| 607693950.0 |  |  |  | 1.113 |
| 608041800.0 |  |  |  | 1.099 |
| 608389650.0 |  |  |  | 1.086 |
| 608737500.0 |  |  |  | 1.072 |
| 609085350.0 |  |  |  | 1.059 |
| 609433200.0 |  |  |  | 1.046 |
| 609781050.0 |  |  |  | 1.033 |
| 610128900.0 |  |  |  | 1.02 |
| 610476750.0 |  |  |  | 1.007 |
| 610824600.0 |  |  |  | 0.995 |
| 611172450.0 |  |  |  | 0.982 |
| 611520300.0 |  |  |  | 0.97 |
| 611868150.0 |  |  |  | 0.958 |
| 612216000.0 |  |  |  | 0.946 |
| 612563850.0 |  |  |  | 0.934 |
| 612911700.0 |  |  |  | 0.922 |
| 613259550.0 |  |  |  | 0.91 |
| 613607400.0 |  |  |  | 0.899 |
| 613955250.0 |  |  |  | 0.888 |
| 614303100.0 |  |  |  | 0.876 |
| 614650950.0 |  |  |  | 0.865 |
| 614998800.0 |  |  |  | 0.854 |
| 615346650.0 |  |  |  | 0.843 |
| 615694500.0 |  |  |  | 0.833 |
| 616042350.0 |  |  |  | 0.822 |
| 616390200.0 |  |  |  | 0.812 |
| 616738050.0 |  |  |  | 0.801 |
| 617085900.0 |  |  |  | 0.791 |
| 617433750.0 |  |  |  | 0.781 |
| 617781600.0 |  |  |  | 0.771 |
| 618129450.0 |  |  |  | 0.761 |
| 618477300.0 |  |  |  | 0.751 |
| 618825150.0 |  |  |  | 0.742 |
| 619173000.0 |  |  |  | 0.732 |
| 619520850.0 |  |  |  | 0.723 |
| 619868700.0 |  |  |  | 0.713 |
| 620216550.0 |  |  |  | 0.704 |
| 620564400.0 |  |  |  | 0.695 |
| 620912250.0 |  |  |  | 0.686 |
| 621260100.0 |  |  |  | 0.677 |
| 621607950.0 |  |  |  | 0.668 |
| 621955800.0 |  |  |  | 0.66 |
| 622303650.0 |  |  |  | 0.651 |
| 622651500.0 |  |  |  | 0.643 |
| 622999350.0 |  |  |  | 0.634 |
| 623347200.0 |  |  |  | 0.626 |
| 623695050.0 |  |  |  | 0.618 |
| 624042900.0 |  |  |  | 0.61 |
| 624390750.0 |  |  |  | 0.602 |
| 624738600.0 |  |  |  | 0.594 |
| 625086450.0 |  |  |  | 0.586 |
| 625434300.0 |  |  |  | 0.578 |
| 625782150.0 |  |  |  | 0.571 |
| 626130000.0 |  |  |  | 0.563 |
| 626477850.0 |  |  |  | 0.556 |
| 626825700.0 |  |  |  | 0.548 |
| 627173550.0 |  |  |  | 0.541 |
| 627521400.0 |  |  |  | 0.534 |
| 627869250.0 |  |  |  | 0.527 |
| 628217100.0 |  |  |  | 0.52 |
| 628564950.0 |  |  |  | 0.513 |
| 628912800.0 |  |  |  | 0.506 |
| 629260650.0 |  |  |  | 0.499 |
| 629608500.0 |  |  |  | 0.492 |
| 629956350.0 |  |  |  | 0.486 |
| 630304200.0 |  |  |  | 0.479 |
| 630652050.0 |  |  |  | 0.473 |
| 630999900.0 |  |  |  | 0.466 |
| 631347750.0 |  |  |  | 0.46 |
| 631695600.0 |  |  |  | 0.454 |
| 632043450.0 |  |  |  | 0.447 |
| 632391300.0 |  |  |  | 0.441 |
| 632739150.0 |  |  |  | 0.435 |
| 633087000.0 |  |  |  | 0.429 |
| 633434850.0 |  |  |  | 0.424 |
| 633782700.0 |  |  |  | 0.418 |
| 634130550.0 |  |  |  | 0.412 |
| 634478400.0 |  |  |  | 0.406 |
| 634826250.0 |  |  |  | 0.401 |
| 635174100.0 |  |  |  | 0.395 |
| 635521950.0 |  |  |  | 0.39 |
| 635869800.0 |  |  |  | 0.384 |
| 636217650.0 |  |  |  | 0.379 |
| 636565500.0 |  |  |  | 0.374 |
| 636913350.0 |  |  |  | 0.368 |
| 637261200.0 |  |  |  | 0.363 |
| 637609050.0 |  |  |  | 0.358 |
| 637956900.0 |  |  |  | 0.353 |
| 638304750.0 |  |  |  | 0.348 |
| 638652600.0 |  |  |  | 0.343 |
| 639000450.0 |  |  |  | 0.338 |
| 639348300.0 |  |  |  | 0.334 |
| 639696150.0 |  |  |  | 0.329 |
| 640044000.0 |  |  |  | 0.324 |
| 640391850.0 |  |  |  | 0.32 |
| 640739700.0 |  |  |  | 0.315 |
| 641087550.0 |  |  |  | 0.31 |
| 641435400.0 |  |  |  | 0.306 |
| 641783250.0 |  |  |  | 0.302 |
| 642131100.0 |  |  |  | 0.297 |
| 642478950.0 |  |  |  | 0.293 |
| 642826800.0 |  |  |  | 0.289 |
| 643174650.0 |  |  |  | 0.284 |
| 643522500.0 |  |  |  | 0.28 |
| 643870350.0 |  |  |  | 0.276 |
| 644218200.0 |  |  |  | 0.272 |
| 644566050.0 |  |  |  | 0.268 |
| 644913900.0 |  |  |  | 0.264 |
| 645261750.0 |  |  |  | 0.26 |
| 645609600.0 |  |  |  | 0.256 |
| 645957450.0 |  |  |  | 0.253 |
| 646305300.0 |  |  |  | 0.249 |
| 646653150.0 |  |  |  | 0.245 |
| 647001000.0 |  |  |  | 0.241 |
| 647348850.0 |  |  |  | 0.238 |
| 647696700.0 |  |  |  | 0.234 |
| 648044550.0 |  |  |  | 0.231 |
| 648392400.0 |  |  |  | 0.227 |
| 648740250.0 |  |  |  | 0.224 |
| 649088100.0 |  |  |  | 0.22 |
| 649435950.0 |  |  |  | 0.217 |
| 649783800.0 |  |  |  | 0.214 |
| 650131650.0 |  |  |  | 0.21 |
| 650479500.0 |  |  |  | 0.207 |
| 650827350.0 |  |  |  | 0.204 |
| 651175200.0 |  |  |  | 0.201 |
| 651523050.0 |  |  |  | 0.198 |
| 651870900.0 |  |  |  | 0.194 |
| 652218750.0 |  |  |  | 0.191 |
| 652566600.0 |  |  |  | 0.188 |
| 652914450.0 |  |  |  | 0.185 |
| 653262300.0 |  |  |  | 0.182 |
| 653610150.0 |  |  |  | 0.18 |
| 653958000.0 |  |  |  | 0.177 |
| 654305850.0 |  |  |  | 0.174 |
| 654653700.0 |  |  |  | 0.171 |
| 655001550.0 |  |  |  | 0.168 |
| 655349400.0 |  |  |  | 0.166 |
| 655697250.0 |  |  |  | 0.163 |
| 656045100.0 |  |  |  | 0.16 |
| 656392950.0 |  |  |  | 0.158 |
| 656740800.0 |  |  |  | 0.155 |
| 657088650.0 |  |  |  | 0.152 |
| 657436500.0 |  |  |  | 0.15 |
| 657784350.0 |  |  |  | 0.147 |
| 658132200.0 |  |  |  | 0.145 |
| 658480050.0 |  |  |  | 0.142 |
| 658827900.0 |  |  |  | 0.14 |
| 659175750.0 |  |  |  | 0.138 |
| 659523600.0 |  |  |  | 0.135 |
| 659871450.0 |  |  |  | 0.133 |
| 660219300.0 |  |  |  | 0.131 |
| 660567150.0 |  |  |  | 0.128 |
| 660915000.0 |  |  |  | 0.126 |
| 661262850.0 |  |  |  | 0.124 |
| 661610700.0 |  |  |  | 0.122 |
| 661958550.0 |  |  |  | 0.12 |
| 662306400.0 |  |  |  | 0.117 |
| 662654250.0 |  |  |  | 0.115 |
| 663002100.0 |  |  |  | 0.113 |
| 663349950.0 |  |  |  | 0.111 |
| 663697800.0 |  |  |  | 0.109 |
| 664045650.0 |  |  |  | 0.107 |
| 664393500.0 |  |  |  | 0.105 |
| 664741350.0 |  |  |  | 0.103 |
| 665089200.0 |  |  |  | 0.101 |
| 665437050.0 |  |  |  | 0.099 |
| 665784900.0 |  |  |  | 0.097 |
| 666132750.0 |  |  |  | 0.096 |
| 666480600.0 |  |  |  | 0.094 |
| 666828450.0 |  |  |  | 0.092 |
| 667176300.0 |  |  |  | 0.09 |
| 667524150.0 |  |  |  | 0.088 |
| 667872000.0 |  |  |  | 0.087 |
| 668219850.0 |  |  |  | 0.085 |
| 668567700.0 |  |  |  | 0.083 |
| 668915550.0 |  |  |  | 0.082 |
| 669263400.0 |  |  |  | 0.08 |
| 669611250.0 |  |  |  | 0.078 |
| 669959100.0 |  |  |  | 0.077 |
| 670306950.0 |  |  |  | 0.075 |
| 670654800.0 |  |  |  | 0.074 |
| 671002650.0 |  |  |  | 0.072 |
| 671350500.0 |  |  |  | 0.07 |
| 671698350.0 |  |  |  | 0.069 |
| 672046200.0 |  |  |  | 0.067 |
| 672394050.0 |  |  |  | 0.066 |
| 672741900.0 |  |  |  | 0.064 |
| 673089750.0 |  |  |  | 0.063 |
| 673437600.0 |  |  |  | 0.062 |
| 673785450.0 |  |  |  | 0.06 |
| 674133300.0 |  |  |  | 0.059 |
| 674481150.0 |  |  |  | 0.057 |
| 674829000.0 |  |  |  | 0.056 |
| 675176850.0 |  |  |  | 0.055 |
| 675524700.0 |  |  |  | 0.053 |
| 675872550.0 |  |  |  | 0.052 |
| 676220400.0 |  |  |  | 0.051 |
| 676568250.0 |  |  |  | 0.05 |
| 676916100.0 |  |  |  | 0.048 |
| 677263950.0 |  |  |  | 0.047 |
| 677611800.0 |  |  |  | 0.046 |
| 677959650.0 |  |  |  | 0.045 |
| 678307500.0 |  |  |  | 0.043 |
| 678655350.0 |  |  |  | 0.042 |
| 679003200.0 |  |  |  | 0.041 |
| 679351050.0 |  |  |  | 0.04 |
| 679698900.0 |  |  |  | 0.039 |
| 680046750.0 |  |  |  | 0.038 |
| 680394600.0 |  |  |  | 0.037 |
| 680742450.0 |  |  |  | 0.036 |
| 681090300.0 |  |  |  | 0.034 |
| 681438150.0 |  |  |  | 0.033 |
| 681786000.0 |  |  |  | 0.032 |
| 682133850.0 |  |  |  | 0.031 |
| 682481700.0 |  |  |  | 0.03 |
| 682829550.0 |  |  |  | 0.029 |
| 683177400.0 |  |  |  | 0.028 |
| 683525250.0 |  |  |  | 0.027 |
| 683873100.0 |  |  |  | 0.026 |
| 684220950.0 |  |  |  | 0.025 |
| 684568800.0 |  |  |  | 0.024 |
| 684916650.0 |  |  |  | 0.024 |
| 685264500.0 |  |  |  | 0.023 |
| 685612350.0 |  |  |  | 0.022 |
| 685960200.0 |  |  |  | 0.021 |
| 686308050.0 |  |  |  | 0.02 |
| 686655900.0 |  |  |  | 0.019 |
| 687003750.0 |  |  |  | 0.018 |
| 687351600.0 |  |  |  | 0.017 |
| 687699450.0 |  |  |  | 0.017 |
| 688047300.0 |  |  |  | 0.016 |
| 688395150.0 |  |  |  | 0.015 |
| 688743000.0 |  |  |  | 0.014 |
| 689090850.0 |  |  |  | 0.013 |
| 689438700.0 |  |  |  | 0.013 |
| 689786550.0 |  |  |  | 0.012 |
| 690134400.0 |  |  |  | 0.011 |
| 690482250.0 |  |  |  | 0.01 |
| 690830100.0 |  |  |  | 0.009 |
| 691177950.0 |  |  |  | 0.009 |
| 691525800.0 |  |  |  | 0.008 |
| 691873650.0 |  |  |  | 0.007 |
| 692221500.0 |  |  |  | 0.007 |
| 692569350.0 |  |  |  | 0.006 |
| 692917200.0 |  |  |  | 0.005 |
| 693265050.0 |  |  |  | 0.005 |
| 693612900.0 |  |  |  | 0.004 |
| 693960750.0 |  |  |  | 0.003 |
| 694308600.0 |  |  |  | 0.003 |
| 694656450.0 |  |  |  | 0.002 |
| 695004300.0 |  |  |  | 0.001 |
| 695352150.0 |  |  |  | 0.001 |
| 695700000.0 |  |  |  | 0 |